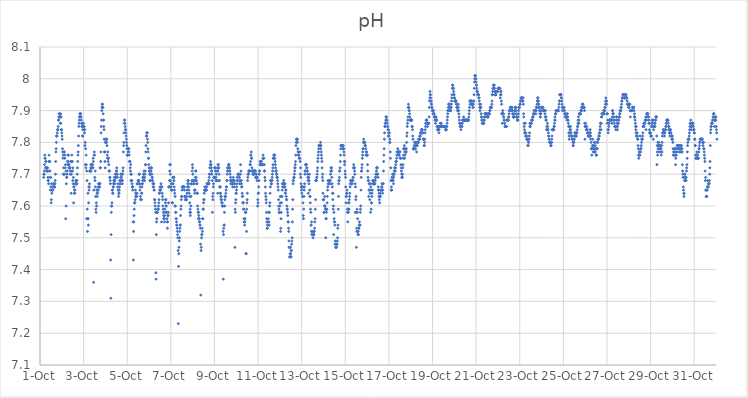
| Category | pH |
|---|---|
| 44470.166666666664 | 7.69 |
| 44470.177083333336 | 7.7 |
| 44470.1875 | 7.7 |
| 44470.197916666664 | 7.71 |
| 44470.208333333336 | 7.73 |
| 44470.21875 | 7.76 |
| 44470.229166666664 | 7.75 |
| 44470.239583333336 | 7.75 |
| 44470.25 | 7.72 |
| 44470.260416666664 | 7.74 |
| 44470.270833333336 | 7.74 |
| 44470.28125 | 7.72 |
| 44470.291666666664 | 7.72 |
| 44470.302083333336 | 7.71 |
| 44470.3125 | 7.72 |
| 44470.322916666664 | 7.72 |
| 44470.333333333336 | 7.71 |
| 44470.34375 | 7.72 |
| 44470.354166666664 | 7.71 |
| 44470.364583333336 | 7.69 |
| 44470.375 | 7.68 |
| 44470.385416666664 | 7.68 |
| 44470.395833333336 | 7.67 |
| 44470.40625 | 7.74 |
| 44470.416666666664 | 7.76 |
| 44470.427083333336 | 7.71 |
| 44470.4375 | 7.74 |
| 44470.447916666664 | 7.74 |
| 44470.458333333336 | 7.71 |
| 44470.46875 | 7.65 |
| 44470.479166666664 | 7.69 |
| 44470.489583333336 | 7.69 |
| 44470.5 | 7.66 |
| 44470.510416666664 | 7.61 |
| 44470.520833333336 | 7.62 |
| 44470.53125 | 7.67 |
| 44470.541666666664 | 7.64 |
| 44470.552083333336 | 7.65 |
| 44470.5625 | 7.65 |
| 44470.572916666664 | 7.65 |
| 44470.583333333336 | 7.65 |
| 44470.59375 | 7.66 |
| 44470.604166666664 | 7.66 |
| 44470.614583333336 | 7.67 |
| 44470.625 | 7.67 |
| 44470.635416666664 | 7.67 |
| 44470.645833333336 | 7.66 |
| 44470.65625 | 7.66 |
| 44470.666666666664 | 7.66 |
| 44470.677083333336 | 7.66 |
| 44470.6875 | 7.67 |
| 44470.697916666664 | 7.68 |
| 44470.708333333336 | 7.7 |
| 44470.71875 | 7.74 |
| 44470.729166666664 | 7.77 |
| 44470.739583333336 | 7.78 |
| 44470.75 | 7.8 |
| 44470.760416666664 | 7.82 |
| 44470.770833333336 | 7.82 |
| 44470.78125 | 7.82 |
| 44470.791666666664 | 7.83 |
| 44470.802083333336 | 7.84 |
| 44470.8125 | 7.84 |
| 44470.822916666664 | 7.84 |
| 44470.833333333336 | 7.85 |
| 44470.84375 | 7.87 |
| 44470.854166666664 | 7.87 |
| 44470.864583333336 | 7.88 |
| 44470.875 | 7.89 |
| 44470.885416666664 | 7.88 |
| 44470.895833333336 | 7.89 |
| 44470.90625 | 7.88 |
| 44470.916666666664 | 7.88 |
| 44470.927083333336 | 7.86 |
| 44470.9375 | 7.88 |
| 44470.947916666664 | 7.89 |
| 44470.958333333336 | 7.86 |
| 44470.96875 | 7.88 |
| 44470.979166666664 | 7.84 |
| 44470.989583333336 | 7.84 |
| 44471.0 | 7.83 |
| 44471.010416666664 | 7.82 |
| 44471.020833333336 | 7.81 |
| 44471.03125 | 7.78 |
| 44471.041666666664 | 7.77 |
| 44471.052083333336 | 7.75 |
| 44471.0625 | 7.76 |
| 44471.072916666664 | 7.7 |
| 44471.083333333336 | 7.72 |
| 44471.09375 | 7.7 |
| 44471.104166666664 | 7.77 |
| 44471.114583333336 | 7.77 |
| 44471.125 | 7.7 |
| 44471.135416666664 | 7.75 |
| 44471.145833333336 | 7.76 |
| 44471.15625 | 7.72 |
| 44471.166666666664 | 7.73 |
| 44471.177083333336 | 7.56 |
| 44471.1875 | 7.71 |
| 44471.197916666664 | 7.6 |
| 44471.208333333336 | 7.67 |
| 44471.21875 | 7.69 |
| 44471.229166666664 | 7.69 |
| 44471.239583333336 | 7.7 |
| 44471.25 | 7.71 |
| 44471.260416666664 | 7.74 |
| 44471.270833333336 | 7.73 |
| 44471.28125 | 7.76 |
| 44471.291666666664 | 7.74 |
| 44471.302083333336 | 7.76 |
| 44471.3125 | 7.73 |
| 44471.322916666664 | 7.72 |
| 44471.333333333336 | 7.73 |
| 44471.34375 | 7.72 |
| 44471.354166666664 | 7.72 |
| 44471.364583333336 | 7.72 |
| 44471.375 | 7.72 |
| 44471.385416666664 | 7.7 |
| 44471.395833333336 | 7.71 |
| 44471.40625 | 7.74 |
| 44471.416666666664 | 7.71 |
| 44471.427083333336 | 7.64 |
| 44471.4375 | 7.7 |
| 44471.447916666664 | 7.74 |
| 44471.458333333336 | 7.76 |
| 44471.46875 | 7.74 |
| 44471.479166666664 | 7.74 |
| 44471.489583333336 | 7.71 |
| 44471.5 | 7.68 |
| 44471.510416666664 | 7.72 |
| 44471.520833333336 | 7.67 |
| 44471.53125 | 7.69 |
| 44471.541666666664 | 7.61 |
| 44471.552083333336 | 7.66 |
| 44471.5625 | 7.66 |
| 44471.572916666664 | 7.64 |
| 44471.583333333336 | 7.65 |
| 44471.59375 | 7.64 |
| 44471.604166666664 | 7.65 |
| 44471.614583333336 | 7.67 |
| 44471.625 | 7.67 |
| 44471.635416666664 | 7.67 |
| 44471.645833333336 | 7.68 |
| 44471.65625 | 7.68 |
| 44471.666666666664 | 7.67 |
| 44471.677083333336 | 7.67 |
| 44471.6875 | 7.67 |
| 44471.697916666664 | 7.68 |
| 44471.708333333336 | 7.7 |
| 44471.71875 | 7.72 |
| 44471.729166666664 | 7.74 |
| 44471.739583333336 | 7.76 |
| 44471.75 | 7.77 |
| 44471.760416666664 | 7.79 |
| 44471.770833333336 | 7.82 |
| 44471.78125 | 7.85 |
| 44471.791666666664 | 7.86 |
| 44471.802083333336 | 7.87 |
| 44471.8125 | 7.88 |
| 44471.822916666664 | 7.88 |
| 44471.833333333336 | 7.89 |
| 44471.84375 | 7.89 |
| 44471.854166666664 | 7.89 |
| 44471.864583333336 | 7.89 |
| 44471.875 | 7.88 |
| 44471.885416666664 | 7.88 |
| 44471.895833333336 | 7.87 |
| 44471.90625 | 7.86 |
| 44471.916666666664 | 7.85 |
| 44471.927083333336 | 7.86 |
| 44471.9375 | 7.85 |
| 44471.947916666664 | 7.82 |
| 44471.958333333336 | 7.84 |
| 44471.96875 | 7.82 |
| 44471.979166666664 | 7.86 |
| 44471.989583333336 | 7.86 |
| 44472.0 | 7.85 |
| 44472.010416666664 | 7.85 |
| 44472.020833333336 | 7.85 |
| 44472.03125 | 7.84 |
| 44472.041666666664 | 7.83 |
| 44472.052083333336 | 7.84 |
| 44472.0625 | 7.79 |
| 44472.072916666664 | 7.8 |
| 44472.083333333336 | 7.73 |
| 44472.09375 | 7.78 |
| 44472.104166666664 | 7.72 |
| 44472.114583333336 | 7.76 |
| 44472.125 | 7.73 |
| 44472.135416666664 | 7.56 |
| 44472.145833333336 | 7.71 |
| 44472.15625 | 7.68 |
| 44472.166666666664 | 7.59 |
| 44472.177083333336 | 7.52 |
| 44472.1875 | 7.56 |
| 44472.197916666664 | 7.64 |
| 44472.208333333336 | 7.56 |
| 44472.21875 | 7.54 |
| 44472.229166666664 | 7.61 |
| 44472.239583333336 | 7.66 |
| 44472.25 | 7.65 |
| 44472.260416666664 | 7.66 |
| 44472.270833333336 | 7.67 |
| 44472.28125 | 7.71 |
| 44472.291666666664 | 7.71 |
| 44472.302083333336 | 7.71 |
| 44472.3125 | 7.71 |
| 44472.322916666664 | 7.72 |
| 44472.333333333336 | 7.73 |
| 44472.34375 | 7.71 |
| 44472.354166666664 | 7.72 |
| 44472.364583333336 | 7.73 |
| 44472.375 | 7.73 |
| 44472.385416666664 | 7.73 |
| 44472.395833333336 | 7.73 |
| 44472.40625 | 7.73 |
| 44472.416666666664 | 7.72 |
| 44472.427083333336 | 7.72 |
| 44472.4375 | 7.75 |
| 44472.447916666664 | 7.74 |
| 44472.458333333336 | 7.36 |
| 44472.46875 | 7.65 |
| 44472.479166666664 | 7.76 |
| 44472.489583333336 | 7.77 |
| 44472.5 | 7.76 |
| 44472.510416666664 | 7.69 |
| 44472.520833333336 | 7.68 |
| 44472.53125 | 7.71 |
| 44472.541666666664 | 7.66 |
| 44472.552083333336 | 7.63 |
| 44472.5625 | 7.59 |
| 44472.572916666664 | 7.58 |
| 44472.583333333336 | 7.61 |
| 44472.59375 | 7.6 |
| 44472.604166666664 | 7.65 |
| 44472.614583333336 | 7.64 |
| 44472.625 | 7.63 |
| 44472.635416666664 | 7.65 |
| 44472.645833333336 | 7.64 |
| 44472.65625 | 7.65 |
| 44472.666666666664 | 7.65 |
| 44472.677083333336 | 7.66 |
| 44472.6875 | 7.67 |
| 44472.697916666664 | 7.67 |
| 44472.708333333336 | 7.67 |
| 44472.71875 | 7.66 |
| 44472.729166666664 | 7.66 |
| 44472.739583333336 | 7.67 |
| 44472.75 | 7.67 |
| 44472.760416666664 | 7.72 |
| 44472.770833333336 | 7.72 |
| 44472.78125 | 7.74 |
| 44472.791666666664 | 7.77 |
| 44472.802083333336 | 7.83 |
| 44472.8125 | 7.85 |
| 44472.822916666664 | 7.87 |
| 44472.833333333336 | 7.9 |
| 44472.84375 | 7.91 |
| 44472.854166666664 | 7.92 |
| 44472.864583333336 | 7.92 |
| 44472.875 | 7.91 |
| 44472.885416666664 | 7.91 |
| 44472.895833333336 | 7.89 |
| 44472.90625 | 7.87 |
| 44472.916666666664 | 7.87 |
| 44472.927083333336 | 7.85 |
| 44472.9375 | 7.84 |
| 44472.947916666664 | 7.81 |
| 44472.958333333336 | 7.77 |
| 44472.96875 | 7.77 |
| 44472.979166666664 | 7.74 |
| 44472.989583333336 | 7.72 |
| 44473.0 | 7.8 |
| 44473.010416666664 | 7.8 |
| 44473.020833333336 | 7.81 |
| 44473.03125 | 7.8 |
| 44473.041666666664 | 7.81 |
| 44473.052083333336 | 7.8 |
| 44473.0625 | 7.81 |
| 44473.072916666664 | 7.79 |
| 44473.083333333336 | 7.76 |
| 44473.09375 | 7.75 |
| 44473.104166666664 | 7.77 |
| 44473.114583333336 | 7.75 |
| 44473.125 | 7.74 |
| 44473.135416666664 | 7.75 |
| 44473.145833333336 | 7.75 |
| 44473.15625 | 7.73 |
| 44473.166666666664 | 7.71 |
| 44473.177083333336 | 7.71 |
| 44473.1875 | 7.71 |
| 44473.197916666664 | 7.69 |
| 44473.208333333336 | 7.69 |
| 44473.21875 | 7.68 |
| 44473.229166666664 | 7.67 |
| 44473.239583333336 | 7.43 |
| 44473.25 | 7.31 |
| 44473.260416666664 | 7.51 |
| 44473.270833333336 | 7.58 |
| 44473.28125 | 7.6 |
| 44473.291666666664 | 7.6 |
| 44473.302083333336 | 7.61 |
| 44473.3125 | 7.65 |
| 44473.322916666664 | 7.65 |
| 44473.333333333336 | 7.64 |
| 44473.34375 | 7.64 |
| 44473.354166666664 | 7.66 |
| 44473.364583333336 | 7.66 |
| 44473.375 | 7.67 |
| 44473.385416666664 | 7.68 |
| 44473.395833333336 | 7.67 |
| 44473.40625 | 7.69 |
| 44473.416666666664 | 7.68 |
| 44473.427083333336 | 7.67 |
| 44473.4375 | 7.68 |
| 44473.447916666664 | 7.69 |
| 44473.458333333336 | 7.7 |
| 44473.46875 | 7.69 |
| 44473.479166666664 | 7.7 |
| 44473.489583333336 | 7.69 |
| 44473.5 | 7.71 |
| 44473.510416666664 | 7.71 |
| 44473.520833333336 | 7.72 |
| 44473.53125 | 7.7 |
| 44473.541666666664 | 7.7 |
| 44473.552083333336 | 7.69 |
| 44473.5625 | 7.66 |
| 44473.572916666664 | 7.67 |
| 44473.583333333336 | 7.65 |
| 44473.59375 | 7.65 |
| 44473.604166666664 | 7.63 |
| 44473.614583333336 | 7.64 |
| 44473.625 | 7.64 |
| 44473.635416666664 | 7.65 |
| 44473.645833333336 | 7.66 |
| 44473.65625 | 7.68 |
| 44473.666666666664 | 7.67 |
| 44473.677083333336 | 7.68 |
| 44473.6875 | 7.67 |
| 44473.697916666664 | 7.69 |
| 44473.708333333336 | 7.7 |
| 44473.71875 | 7.7 |
| 44473.729166666664 | 7.7 |
| 44473.739583333336 | 7.69 |
| 44473.75 | 7.68 |
| 44473.760416666664 | 7.68 |
| 44473.770833333336 | 7.67 |
| 44473.78125 | 7.68 |
| 44473.791666666664 | 7.7 |
| 44473.802083333336 | 7.71 |
| 44473.8125 | 7.72 |
| 44473.822916666664 | 7.77 |
| 44473.833333333336 | 7.79 |
| 44473.84375 | 7.8 |
| 44473.854166666664 | 7.83 |
| 44473.864583333336 | 7.86 |
| 44473.875 | 7.87 |
| 44473.885416666664 | 7.87 |
| 44473.895833333336 | 7.86 |
| 44473.90625 | 7.85 |
| 44473.916666666664 | 7.84 |
| 44473.927083333336 | 7.84 |
| 44473.9375 | 7.83 |
| 44473.947916666664 | 7.82 |
| 44473.958333333336 | 7.81 |
| 44473.96875 | 7.8 |
| 44473.979166666664 | 7.79 |
| 44473.989583333336 | 7.78 |
| 44474.0 | 7.76 |
| 44474.010416666664 | 7.76 |
| 44474.020833333336 | 7.76 |
| 44474.03125 | 7.77 |
| 44474.041666666664 | 7.78 |
| 44474.052083333336 | 7.78 |
| 44474.0625 | 7.78 |
| 44474.072916666664 | 7.78 |
| 44474.083333333336 | 7.77 |
| 44474.09375 | 7.76 |
| 44474.104166666664 | 7.74 |
| 44474.114583333336 | 7.74 |
| 44474.125 | 7.74 |
| 44474.135416666664 | 7.72 |
| 44474.145833333336 | 7.71 |
| 44474.15625 | 7.73 |
| 44474.166666666664 | 7.7 |
| 44474.177083333336 | 7.68 |
| 44474.1875 | 7.7 |
| 44474.197916666664 | 7.68 |
| 44474.208333333336 | 7.68 |
| 44474.21875 | 7.67 |
| 44474.229166666664 | 7.66 |
| 44474.239583333336 | 7.66 |
| 44474.25 | 7.65 |
| 44474.260416666664 | 7.66 |
| 44474.270833333336 | 7.55 |
| 44474.28125 | 7.43 |
| 44474.291666666664 | 7.52 |
| 44474.302083333336 | 7.55 |
| 44474.3125 | 7.57 |
| 44474.322916666664 | 7.59 |
| 44474.333333333336 | 7.61 |
| 44474.34375 | 7.61 |
| 44474.354166666664 | 7.61 |
| 44474.364583333336 | 7.62 |
| 44474.375 | 7.65 |
| 44474.385416666664 | 7.64 |
| 44474.395833333336 | 7.63 |
| 44474.40625 | 7.63 |
| 44474.416666666664 | 7.63 |
| 44474.427083333336 | 7.64 |
| 44474.4375 | 7.63 |
| 44474.447916666664 | 7.64 |
| 44474.458333333336 | 7.67 |
| 44474.46875 | 7.67 |
| 44474.479166666664 | 7.67 |
| 44474.489583333336 | 7.67 |
| 44474.5 | 7.68 |
| 44474.510416666664 | 7.68 |
| 44474.520833333336 | 7.68 |
| 44474.53125 | 7.68 |
| 44474.541666666664 | 7.7 |
| 44474.552083333336 | 7.67 |
| 44474.5625 | 7.7 |
| 44474.572916666664 | 7.67 |
| 44474.583333333336 | 7.65 |
| 44474.59375 | 7.66 |
| 44474.604166666664 | 7.63 |
| 44474.614583333336 | 7.62 |
| 44474.625 | 7.62 |
| 44474.635416666664 | 7.62 |
| 44474.645833333336 | 7.62 |
| 44474.65625 | 7.64 |
| 44474.666666666664 | 7.64 |
| 44474.677083333336 | 7.66 |
| 44474.6875 | 7.67 |
| 44474.697916666664 | 7.67 |
| 44474.708333333336 | 7.68 |
| 44474.71875 | 7.69 |
| 44474.729166666664 | 7.69 |
| 44474.739583333336 | 7.69 |
| 44474.75 | 7.7 |
| 44474.760416666664 | 7.7 |
| 44474.770833333336 | 7.71 |
| 44474.78125 | 7.68 |
| 44474.791666666664 | 7.68 |
| 44474.802083333336 | 7.69 |
| 44474.8125 | 7.7 |
| 44474.822916666664 | 7.71 |
| 44474.833333333336 | 7.73 |
| 44474.84375 | 7.73 |
| 44474.854166666664 | 7.77 |
| 44474.864583333336 | 7.79 |
| 44474.875 | 7.82 |
| 44474.885416666664 | 7.82 |
| 44474.895833333336 | 7.83 |
| 44474.90625 | 7.83 |
| 44474.916666666664 | 7.83 |
| 44474.927083333336 | 7.81 |
| 44474.9375 | 7.8 |
| 44474.947916666664 | 7.78 |
| 44474.958333333336 | 7.77 |
| 44474.96875 | 7.75 |
| 44474.979166666664 | 7.75 |
| 44474.989583333336 | 7.73 |
| 44475.0 | 7.72 |
| 44475.010416666664 | 7.71 |
| 44475.020833333336 | 7.71 |
| 44475.03125 | 7.7 |
| 44475.041666666664 | 7.68 |
| 44475.052083333336 | 7.68 |
| 44475.0625 | 7.7 |
| 44475.072916666664 | 7.71 |
| 44475.083333333336 | 7.72 |
| 44475.09375 | 7.71 |
| 44475.104166666664 | 7.72 |
| 44475.114583333336 | 7.72 |
| 44475.125 | 7.7 |
| 44475.135416666664 | 7.69 |
| 44475.145833333336 | 7.68 |
| 44475.15625 | 7.69 |
| 44475.166666666664 | 7.68 |
| 44475.177083333336 | 7.67 |
| 44475.1875 | 7.66 |
| 44475.197916666664 | 7.67 |
| 44475.208333333336 | 7.66 |
| 44475.21875 | 7.67 |
| 44475.229166666664 | 7.65 |
| 44475.239583333336 | 7.65 |
| 44475.25 | 7.62 |
| 44475.260416666664 | 7.62 |
| 44475.270833333336 | 7.61 |
| 44475.28125 | 7.6 |
| 44475.291666666664 | 7.59 |
| 44475.302083333336 | 7.58 |
| 44475.3125 | 7.39 |
| 44475.322916666664 | 7.37 |
| 44475.333333333336 | 7.51 |
| 44475.34375 | 7.55 |
| 44475.354166666664 | 7.56 |
| 44475.364583333336 | 7.58 |
| 44475.375 | 7.58 |
| 44475.385416666664 | 7.58 |
| 44475.395833333336 | 7.59 |
| 44475.40625 | 7.59 |
| 44475.416666666664 | 7.59 |
| 44475.427083333336 | 7.59 |
| 44475.4375 | 7.6 |
| 44475.447916666664 | 7.61 |
| 44475.458333333336 | 7.62 |
| 44475.46875 | 7.64 |
| 44475.479166666664 | 7.64 |
| 44475.489583333336 | 7.65 |
| 44475.5 | 7.66 |
| 44475.510416666664 | 7.65 |
| 44475.520833333336 | 7.65 |
| 44475.53125 | 7.65 |
| 44475.541666666664 | 7.66 |
| 44475.552083333336 | 7.67 |
| 44475.5625 | 7.66 |
| 44475.572916666664 | 7.55 |
| 44475.583333333336 | 7.66 |
| 44475.59375 | 7.66 |
| 44475.604166666664 | 7.64 |
| 44475.614583333336 | 7.63 |
| 44475.625 | 7.62 |
| 44475.635416666664 | 7.6 |
| 44475.645833333336 | 7.59 |
| 44475.65625 | 7.58 |
| 44475.666666666664 | 7.57 |
| 44475.677083333336 | 7.56 |
| 44475.6875 | 7.56 |
| 44475.697916666664 | 7.56 |
| 44475.708333333336 | 7.55 |
| 44475.71875 | 7.57 |
| 44475.729166666664 | 7.59 |
| 44475.739583333336 | 7.58 |
| 44475.75 | 7.61 |
| 44475.760416666664 | 7.62 |
| 44475.770833333336 | 7.62 |
| 44475.78125 | 7.6 |
| 44475.791666666664 | 7.6 |
| 44475.802083333336 | 7.58 |
| 44475.8125 | 7.58 |
| 44475.822916666664 | 7.56 |
| 44475.833333333336 | 7.55 |
| 44475.84375 | 7.53 |
| 44475.854166666664 | 7.55 |
| 44475.864583333336 | 7.57 |
| 44475.875 | 7.57 |
| 44475.885416666664 | 7.58 |
| 44475.895833333336 | 7.61 |
| 44475.90625 | 7.66 |
| 44475.916666666664 | 7.66 |
| 44475.927083333336 | 7.66 |
| 44475.9375 | 7.68 |
| 44475.947916666664 | 7.71 |
| 44475.958333333336 | 7.73 |
| 44475.96875 | 7.73 |
| 44475.979166666664 | 7.7 |
| 44475.989583333336 | 7.68 |
| 44476.0 | 7.66 |
| 44476.010416666664 | 7.66 |
| 44476.020833333336 | 7.67 |
| 44476.03125 | 7.65 |
| 44476.041666666664 | 7.65 |
| 44476.052083333336 | 7.65 |
| 44476.0625 | 7.61 |
| 44476.072916666664 | 7.61 |
| 44476.083333333336 | 7.67 |
| 44476.09375 | 7.69 |
| 44476.104166666664 | 7.67 |
| 44476.114583333336 | 7.69 |
| 44476.125 | 7.69 |
| 44476.135416666664 | 7.69 |
| 44476.145833333336 | 7.68 |
| 44476.15625 | 7.66 |
| 44476.166666666664 | 7.65 |
| 44476.177083333336 | 7.64 |
| 44476.1875 | 7.6 |
| 44476.197916666664 | 7.63 |
| 44476.208333333336 | 7.6 |
| 44476.21875 | 7.58 |
| 44476.229166666664 | 7.58 |
| 44476.239583333336 | 7.56 |
| 44476.25 | 7.56 |
| 44476.260416666664 | 7.55 |
| 44476.270833333336 | 7.54 |
| 44476.28125 | 7.54 |
| 44476.291666666664 | 7.53 |
| 44476.302083333336 | 7.52 |
| 44476.3125 | 7.51 |
| 44476.322916666664 | 7.5 |
| 44476.333333333336 | 7.46 |
| 44476.34375 | 7.23 |
| 44476.354166666664 | 7.41 |
| 44476.364583333336 | 7.45 |
| 44476.375 | 7.47 |
| 44476.385416666664 | 7.49 |
| 44476.395833333336 | 7.5 |
| 44476.40625 | 7.52 |
| 44476.416666666664 | 7.53 |
| 44476.427083333336 | 7.54 |
| 44476.4375 | 7.54 |
| 44476.447916666664 | 7.57 |
| 44476.458333333336 | 7.59 |
| 44476.46875 | 7.6 |
| 44476.479166666664 | 7.62 |
| 44476.489583333336 | 7.63 |
| 44476.5 | 7.63 |
| 44476.510416666664 | 7.65 |
| 44476.520833333336 | 7.66 |
| 44476.53125 | 7.66 |
| 44476.541666666664 | 7.66 |
| 44476.552083333336 | 7.66 |
| 44476.5625 | 7.66 |
| 44476.572916666664 | 7.66 |
| 44476.583333333336 | 7.66 |
| 44476.59375 | 7.66 |
| 44476.604166666664 | 7.66 |
| 44476.614583333336 | 7.66 |
| 44476.625 | 7.65 |
| 44476.635416666664 | 7.63 |
| 44476.645833333336 | 7.63 |
| 44476.65625 | 7.63 |
| 44476.666666666664 | 7.62 |
| 44476.677083333336 | 7.62 |
| 44476.6875 | 7.62 |
| 44476.697916666664 | 7.62 |
| 44476.708333333336 | 7.62 |
| 44476.71875 | 7.62 |
| 44476.729166666664 | 7.63 |
| 44476.739583333336 | 7.64 |
| 44476.75 | 7.65 |
| 44476.760416666664 | 7.66 |
| 44476.770833333336 | 7.67 |
| 44476.78125 | 7.68 |
| 44476.791666666664 | 7.68 |
| 44476.802083333336 | 7.68 |
| 44476.8125 | 7.67 |
| 44476.822916666664 | 7.66 |
| 44476.833333333336 | 7.65 |
| 44476.84375 | 7.64 |
| 44476.854166666664 | 7.63 |
| 44476.864583333336 | 7.61 |
| 44476.875 | 7.58 |
| 44476.885416666664 | 7.59 |
| 44476.895833333336 | 7.57 |
| 44476.90625 | 7.58 |
| 44476.916666666664 | 7.6 |
| 44476.927083333336 | 7.63 |
| 44476.9375 | 7.67 |
| 44476.947916666664 | 7.67 |
| 44476.958333333336 | 7.67 |
| 44476.96875 | 7.68 |
| 44476.979166666664 | 7.71 |
| 44476.989583333336 | 7.73 |
| 44477.0 | 7.72 |
| 44477.010416666664 | 7.7 |
| 44477.020833333336 | 7.68 |
| 44477.03125 | 7.68 |
| 44477.041666666664 | 7.67 |
| 44477.052083333336 | 7.68 |
| 44477.0625 | 7.68 |
| 44477.072916666664 | 7.67 |
| 44477.083333333336 | 7.65 |
| 44477.09375 | 7.64 |
| 44477.104166666664 | 7.65 |
| 44477.114583333336 | 7.65 |
| 44477.125 | 7.69 |
| 44477.135416666664 | 7.71 |
| 44477.145833333336 | 7.68 |
| 44477.15625 | 7.71 |
| 44477.166666666664 | 7.69 |
| 44477.177083333336 | 7.68 |
| 44477.1875 | 7.67 |
| 44477.197916666664 | 7.67 |
| 44477.208333333336 | 7.64 |
| 44477.21875 | 7.64 |
| 44477.229166666664 | 7.6 |
| 44477.239583333336 | 7.59 |
| 44477.25 | 7.58 |
| 44477.260416666664 | 7.56 |
| 44477.270833333336 | 7.58 |
| 44477.28125 | 7.57 |
| 44477.291666666664 | 7.56 |
| 44477.302083333336 | 7.56 |
| 44477.3125 | 7.55 |
| 44477.322916666664 | 7.55 |
| 44477.333333333336 | 7.54 |
| 44477.34375 | 7.54 |
| 44477.354166666664 | 7.53 |
| 44477.364583333336 | 7.48 |
| 44477.375 | 7.32 |
| 44477.385416666664 | 7.46 |
| 44477.395833333336 | 7.47 |
| 44477.40625 | 7.5 |
| 44477.416666666664 | 7.51 |
| 44477.427083333336 | 7.51 |
| 44477.4375 | 7.53 |
| 44477.447916666664 | 7.52 |
| 44477.458333333336 | 7.56 |
| 44477.46875 | 7.56 |
| 44477.479166666664 | 7.59 |
| 44477.489583333336 | 7.59 |
| 44477.5 | 7.61 |
| 44477.510416666664 | 7.62 |
| 44477.520833333336 | 7.62 |
| 44477.53125 | 7.64 |
| 44477.541666666664 | 7.65 |
| 44477.552083333336 | 7.65 |
| 44477.5625 | 7.66 |
| 44477.572916666664 | 7.66 |
| 44477.583333333336 | 7.65 |
| 44477.59375 | 7.65 |
| 44477.604166666664 | 7.65 |
| 44477.614583333336 | 7.65 |
| 44477.625 | 7.65 |
| 44477.635416666664 | 7.65 |
| 44477.645833333336 | 7.66 |
| 44477.65625 | 7.67 |
| 44477.666666666664 | 7.67 |
| 44477.677083333336 | 7.67 |
| 44477.6875 | 7.67 |
| 44477.697916666664 | 7.67 |
| 44477.708333333336 | 7.67 |
| 44477.71875 | 7.67 |
| 44477.729166666664 | 7.67 |
| 44477.739583333336 | 7.68 |
| 44477.75 | 7.67 |
| 44477.760416666664 | 7.69 |
| 44477.770833333336 | 7.7 |
| 44477.78125 | 7.7 |
| 44477.791666666664 | 7.72 |
| 44477.802083333336 | 7.72 |
| 44477.8125 | 7.73 |
| 44477.822916666664 | 7.74 |
| 44477.833333333336 | 7.73 |
| 44477.84375 | 7.73 |
| 44477.854166666664 | 7.72 |
| 44477.864583333336 | 7.71 |
| 44477.875 | 7.71 |
| 44477.885416666664 | 7.7 |
| 44477.895833333336 | 7.68 |
| 44477.90625 | 7.58 |
| 44477.916666666664 | 7.63 |
| 44477.927083333336 | 7.62 |
| 44477.9375 | 7.64 |
| 44477.947916666664 | 7.66 |
| 44477.958333333336 | 7.67 |
| 44477.96875 | 7.69 |
| 44477.979166666664 | 7.69 |
| 44477.989583333336 | 7.69 |
| 44478.0 | 7.69 |
| 44478.010416666664 | 7.72 |
| 44478.020833333336 | 7.72 |
| 44478.03125 | 7.72 |
| 44478.041666666664 | 7.71 |
| 44478.052083333336 | 7.69 |
| 44478.0625 | 7.69 |
| 44478.072916666664 | 7.68 |
| 44478.083333333336 | 7.7 |
| 44478.09375 | 7.68 |
| 44478.104166666664 | 7.68 |
| 44478.114583333336 | 7.68 |
| 44478.125 | 7.71 |
| 44478.135416666664 | 7.72 |
| 44478.145833333336 | 7.64 |
| 44478.15625 | 7.71 |
| 44478.166666666664 | 7.73 |
| 44478.177083333336 | 7.73 |
| 44478.1875 | 7.72 |
| 44478.197916666664 | 7.72 |
| 44478.208333333336 | 7.7 |
| 44478.21875 | 7.68 |
| 44478.229166666664 | 7.68 |
| 44478.239583333336 | 7.66 |
| 44478.25 | 7.66 |
| 44478.260416666664 | 7.64 |
| 44478.270833333336 | 7.66 |
| 44478.28125 | 7.64 |
| 44478.291666666664 | 7.63 |
| 44478.302083333336 | 7.62 |
| 44478.3125 | 7.63 |
| 44478.322916666664 | 7.62 |
| 44478.333333333336 | 7.61 |
| 44478.34375 | 7.61 |
| 44478.354166666664 | 7.61 |
| 44478.364583333336 | 7.6 |
| 44478.375 | 7.6 |
| 44478.385416666664 | 7.6 |
| 44478.395833333336 | 7.52 |
| 44478.40625 | 7.37 |
| 44478.416666666664 | 7.51 |
| 44478.427083333336 | 7.53 |
| 44478.4375 | 7.54 |
| 44478.447916666664 | 7.54 |
| 44478.458333333336 | 7.58 |
| 44478.46875 | 7.6 |
| 44478.479166666664 | 7.62 |
| 44478.489583333336 | 7.63 |
| 44478.5 | 7.63 |
| 44478.510416666664 | 7.63 |
| 44478.520833333336 | 7.64 |
| 44478.53125 | 7.65 |
| 44478.541666666664 | 7.66 |
| 44478.552083333336 | 7.66 |
| 44478.5625 | 7.68 |
| 44478.572916666664 | 7.68 |
| 44478.583333333336 | 7.7 |
| 44478.59375 | 7.72 |
| 44478.604166666664 | 7.71 |
| 44478.614583333336 | 7.71 |
| 44478.625 | 7.72 |
| 44478.635416666664 | 7.72 |
| 44478.645833333336 | 7.73 |
| 44478.65625 | 7.73 |
| 44478.666666666664 | 7.73 |
| 44478.677083333336 | 7.72 |
| 44478.6875 | 7.71 |
| 44478.697916666664 | 7.72 |
| 44478.708333333336 | 7.71 |
| 44478.71875 | 7.7 |
| 44478.729166666664 | 7.68 |
| 44478.739583333336 | 7.69 |
| 44478.75 | 7.67 |
| 44478.760416666664 | 7.68 |
| 44478.770833333336 | 7.68 |
| 44478.78125 | 7.68 |
| 44478.791666666664 | 7.67 |
| 44478.802083333336 | 7.68 |
| 44478.8125 | 7.68 |
| 44478.822916666664 | 7.67 |
| 44478.833333333336 | 7.66 |
| 44478.84375 | 7.67 |
| 44478.854166666664 | 7.68 |
| 44478.864583333336 | 7.69 |
| 44478.875 | 7.68 |
| 44478.885416666664 | 7.68 |
| 44478.895833333336 | 7.67 |
| 44478.90625 | 7.66 |
| 44478.916666666664 | 7.68 |
| 44478.927083333336 | 7.67 |
| 44478.9375 | 7.47 |
| 44478.947916666664 | 7.59 |
| 44478.958333333336 | 7.58 |
| 44478.96875 | 7.61 |
| 44478.979166666664 | 7.62 |
| 44478.989583333336 | 7.64 |
| 44479.0 | 7.64 |
| 44479.010416666664 | 7.65 |
| 44479.020833333336 | 7.66 |
| 44479.03125 | 7.67 |
| 44479.041666666664 | 7.69 |
| 44479.052083333336 | 7.68 |
| 44479.0625 | 7.68 |
| 44479.072916666664 | 7.7 |
| 44479.083333333336 | 7.7 |
| 44479.09375 | 7.7 |
| 44479.104166666664 | 7.7 |
| 44479.114583333336 | 7.7 |
| 44479.125 | 7.7 |
| 44479.135416666664 | 7.69 |
| 44479.145833333336 | 7.69 |
| 44479.15625 | 7.67 |
| 44479.166666666664 | 7.68 |
| 44479.177083333336 | 7.67 |
| 44479.1875 | 7.7 |
| 44479.197916666664 | 7.73 |
| 44479.208333333336 | 7.68 |
| 44479.21875 | 7.71 |
| 44479.229166666664 | 7.68 |
| 44479.239583333336 | 7.67 |
| 44479.25 | 7.66 |
| 44479.260416666664 | 7.66 |
| 44479.270833333336 | 7.64 |
| 44479.28125 | 7.63 |
| 44479.291666666664 | 7.63 |
| 44479.302083333336 | 7.61 |
| 44479.3125 | 7.61 |
| 44479.322916666664 | 7.61 |
| 44479.333333333336 | 7.59 |
| 44479.34375 | 7.59 |
| 44479.354166666664 | 7.56 |
| 44479.364583333336 | 7.55 |
| 44479.375 | 7.55 |
| 44479.385416666664 | 7.54 |
| 44479.395833333336 | 7.55 |
| 44479.40625 | 7.56 |
| 44479.416666666664 | 7.58 |
| 44479.427083333336 | 7.58 |
| 44479.4375 | 7.58 |
| 44479.447916666664 | 7.45 |
| 44479.458333333336 | 7.45 |
| 44479.46875 | 7.52 |
| 44479.479166666664 | 7.59 |
| 44479.489583333336 | 7.61 |
| 44479.5 | 7.62 |
| 44479.510416666664 | 7.64 |
| 44479.520833333336 | 7.68 |
| 44479.53125 | 7.69 |
| 44479.541666666664 | 7.7 |
| 44479.552083333336 | 7.7 |
| 44479.5625 | 7.7 |
| 44479.572916666664 | 7.71 |
| 44479.583333333336 | 7.71 |
| 44479.59375 | 7.71 |
| 44479.604166666664 | 7.71 |
| 44479.614583333336 | 7.71 |
| 44479.625 | 7.71 |
| 44479.635416666664 | 7.73 |
| 44479.645833333336 | 7.73 |
| 44479.65625 | 7.74 |
| 44479.666666666664 | 7.76 |
| 44479.677083333336 | 7.76 |
| 44479.6875 | 7.77 |
| 44479.697916666664 | 7.75 |
| 44479.708333333336 | 7.75 |
| 44479.71875 | 7.72 |
| 44479.729166666664 | 7.71 |
| 44479.739583333336 | 7.71 |
| 44479.75 | 7.71 |
| 44479.760416666664 | 7.7 |
| 44479.770833333336 | 7.7 |
| 44479.78125 | 7.71 |
| 44479.791666666664 | 7.7 |
| 44479.802083333336 | 7.71 |
| 44479.8125 | 7.7 |
| 44479.822916666664 | 7.71 |
| 44479.833333333336 | 7.71 |
| 44479.84375 | 7.71 |
| 44479.854166666664 | 7.71 |
| 44479.864583333336 | 7.71 |
| 44479.875 | 7.71 |
| 44479.885416666664 | 7.69 |
| 44479.895833333336 | 7.69 |
| 44479.90625 | 7.7 |
| 44479.916666666664 | 7.7 |
| 44479.927083333336 | 7.69 |
| 44479.9375 | 7.69 |
| 44479.947916666664 | 7.68 |
| 44479.958333333336 | 7.69 |
| 44479.96875 | 7.69 |
| 44479.979166666664 | 7.6 |
| 44479.989583333336 | 7.62 |
| 44480.0 | 7.61 |
| 44480.010416666664 | 7.64 |
| 44480.020833333336 | 7.64 |
| 44480.03125 | 7.66 |
| 44480.041666666664 | 7.68 |
| 44480.052083333336 | 7.7 |
| 44480.0625 | 7.71 |
| 44480.072916666664 | 7.71 |
| 44480.083333333336 | 7.73 |
| 44480.09375 | 7.74 |
| 44480.104166666664 | 7.73 |
| 44480.114583333336 | 7.73 |
| 44480.125 | 7.73 |
| 44480.135416666664 | 7.74 |
| 44480.145833333336 | 7.74 |
| 44480.15625 | 7.74 |
| 44480.166666666664 | 7.73 |
| 44480.177083333336 | 7.73 |
| 44480.1875 | 7.73 |
| 44480.197916666664 | 7.73 |
| 44480.208333333336 | 7.73 |
| 44480.21875 | 7.75 |
| 44480.229166666664 | 7.76 |
| 44480.239583333336 | 7.75 |
| 44480.25 | 7.75 |
| 44480.260416666664 | 7.75 |
| 44480.270833333336 | 7.73 |
| 44480.28125 | 7.73 |
| 44480.291666666664 | 7.71 |
| 44480.302083333336 | 7.71 |
| 44480.3125 | 7.69 |
| 44480.322916666664 | 7.68 |
| 44480.333333333336 | 7.66 |
| 44480.34375 | 7.64 |
| 44480.354166666664 | 7.63 |
| 44480.364583333336 | 7.62 |
| 44480.375 | 7.61 |
| 44480.385416666664 | 7.58 |
| 44480.395833333336 | 7.56 |
| 44480.40625 | 7.55 |
| 44480.416666666664 | 7.53 |
| 44480.427083333336 | 7.53 |
| 44480.4375 | 7.54 |
| 44480.447916666664 | 7.54 |
| 44480.458333333336 | 7.55 |
| 44480.46875 | 7.56 |
| 44480.479166666664 | 7.58 |
| 44480.489583333336 | 7.58 |
| 44480.5 | 7.55 |
| 44480.510416666664 | 7.54 |
| 44480.520833333336 | 7.58 |
| 44480.53125 | 7.6 |
| 44480.541666666664 | 7.61 |
| 44480.552083333336 | 7.64 |
| 44480.5625 | 7.66 |
| 44480.572916666664 | 7.68 |
| 44480.583333333336 | 7.68 |
| 44480.59375 | 7.68 |
| 44480.604166666664 | 7.67 |
| 44480.614583333336 | 7.67 |
| 44480.625 | 7.68 |
| 44480.635416666664 | 7.68 |
| 44480.645833333336 | 7.69 |
| 44480.65625 | 7.7 |
| 44480.666666666664 | 7.71 |
| 44480.677083333336 | 7.72 |
| 44480.6875 | 7.73 |
| 44480.697916666664 | 7.75 |
| 44480.708333333336 | 7.75 |
| 44480.71875 | 7.76 |
| 44480.729166666664 | 7.75 |
| 44480.739583333336 | 7.76 |
| 44480.75 | 7.76 |
| 44480.760416666664 | 7.76 |
| 44480.770833333336 | 7.75 |
| 44480.78125 | 7.74 |
| 44480.791666666664 | 7.73 |
| 44480.802083333336 | 7.72 |
| 44480.8125 | 7.71 |
| 44480.822916666664 | 7.71 |
| 44480.833333333336 | 7.71 |
| 44480.84375 | 7.7 |
| 44480.854166666664 | 7.7 |
| 44480.864583333336 | 7.69 |
| 44480.875 | 7.69 |
| 44480.885416666664 | 7.69 |
| 44480.895833333336 | 7.68 |
| 44480.90625 | 7.67 |
| 44480.916666666664 | 7.66 |
| 44480.927083333336 | 7.65 |
| 44480.9375 | 7.62 |
| 44480.947916666664 | 7.6 |
| 44480.958333333336 | 7.59 |
| 44480.96875 | 7.58 |
| 44480.979166666664 | 7.58 |
| 44480.989583333336 | 7.58 |
| 44481.0 | 7.6 |
| 44481.010416666664 | 7.61 |
| 44481.020833333336 | 7.63 |
| 44481.03125 | 7.52 |
| 44481.041666666664 | 7.53 |
| 44481.052083333336 | 7.56 |
| 44481.0625 | 7.58 |
| 44481.072916666664 | 7.61 |
| 44481.083333333336 | 7.63 |
| 44481.09375 | 7.63 |
| 44481.104166666664 | 7.65 |
| 44481.114583333336 | 7.67 |
| 44481.125 | 7.66 |
| 44481.135416666664 | 7.67 |
| 44481.145833333336 | 7.67 |
| 44481.15625 | 7.67 |
| 44481.166666666664 | 7.67 |
| 44481.177083333336 | 7.68 |
| 44481.1875 | 7.66 |
| 44481.197916666664 | 7.67 |
| 44481.208333333336 | 7.66 |
| 44481.21875 | 7.66 |
| 44481.229166666664 | 7.66 |
| 44481.239583333336 | 7.67 |
| 44481.25 | 7.64 |
| 44481.260416666664 | 7.64 |
| 44481.270833333336 | 7.65 |
| 44481.28125 | 7.65 |
| 44481.291666666664 | 7.63 |
| 44481.302083333336 | 7.62 |
| 44481.3125 | 7.62 |
| 44481.322916666664 | 7.6 |
| 44481.333333333336 | 7.59 |
| 44481.34375 | 7.59 |
| 44481.354166666664 | 7.58 |
| 44481.364583333336 | 7.57 |
| 44481.375 | 7.55 |
| 44481.385416666664 | 7.55 |
| 44481.395833333336 | 7.53 |
| 44481.40625 | 7.52 |
| 44481.416666666664 | 7.49 |
| 44481.427083333336 | 7.47 |
| 44481.4375 | 7.47 |
| 44481.447916666664 | 7.44 |
| 44481.458333333336 | 7.44 |
| 44481.46875 | 7.45 |
| 44481.479166666664 | 7.44 |
| 44481.489583333336 | 7.47 |
| 44481.5 | 7.45 |
| 44481.510416666664 | 7.46 |
| 44481.520833333336 | 7.44 |
| 44481.53125 | 7.46 |
| 44481.541666666664 | 7.48 |
| 44481.552083333336 | 7.49 |
| 44481.5625 | 7.5 |
| 44481.572916666664 | 7.55 |
| 44481.583333333336 | 7.59 |
| 44481.59375 | 7.62 |
| 44481.604166666664 | 7.67 |
| 44481.614583333336 | 7.68 |
| 44481.625 | 7.68 |
| 44481.635416666664 | 7.69 |
| 44481.645833333336 | 7.69 |
| 44481.65625 | 7.69 |
| 44481.666666666664 | 7.7 |
| 44481.677083333336 | 7.71 |
| 44481.6875 | 7.72 |
| 44481.697916666664 | 7.72 |
| 44481.708333333336 | 7.73 |
| 44481.71875 | 7.74 |
| 44481.729166666664 | 7.76 |
| 44481.739583333336 | 7.79 |
| 44481.75 | 7.8 |
| 44481.760416666664 | 7.81 |
| 44481.770833333336 | 7.81 |
| 44481.78125 | 7.81 |
| 44481.791666666664 | 7.81 |
| 44481.802083333336 | 7.81 |
| 44481.8125 | 7.8 |
| 44481.822916666664 | 7.78 |
| 44481.833333333336 | 7.77 |
| 44481.84375 | 7.76 |
| 44481.854166666664 | 7.76 |
| 44481.864583333336 | 7.77 |
| 44481.875 | 7.76 |
| 44481.885416666664 | 7.75 |
| 44481.895833333336 | 7.75 |
| 44481.90625 | 7.77 |
| 44481.916666666664 | 7.75 |
| 44481.927083333336 | 7.74 |
| 44481.9375 | 7.7 |
| 44481.947916666664 | 7.72 |
| 44481.958333333336 | 7.69 |
| 44481.96875 | 7.67 |
| 44481.979166666664 | 7.66 |
| 44481.989583333336 | 7.65 |
| 44482.0 | 7.66 |
| 44482.010416666664 | 7.64 |
| 44482.020833333336 | 7.66 |
| 44482.03125 | 7.63 |
| 44482.041666666664 | 7.66 |
| 44482.052083333336 | 7.66 |
| 44482.0625 | 7.61 |
| 44482.072916666664 | 7.57 |
| 44482.083333333336 | 7.56 |
| 44482.09375 | 7.59 |
| 44482.104166666664 | 7.63 |
| 44482.114583333336 | 7.65 |
| 44482.125 | 7.66 |
| 44482.135416666664 | 7.67 |
| 44482.145833333336 | 7.7 |
| 44482.15625 | 7.71 |
| 44482.166666666664 | 7.71 |
| 44482.177083333336 | 7.73 |
| 44482.1875 | 7.73 |
| 44482.197916666664 | 7.73 |
| 44482.208333333336 | 7.73 |
| 44482.21875 | 7.73 |
| 44482.229166666664 | 7.72 |
| 44482.239583333336 | 7.72 |
| 44482.25 | 7.71 |
| 44482.260416666664 | 7.71 |
| 44482.270833333336 | 7.7 |
| 44482.28125 | 7.69 |
| 44482.291666666664 | 7.68 |
| 44482.302083333336 | 7.64 |
| 44482.3125 | 7.69 |
| 44482.322916666664 | 7.69 |
| 44482.333333333336 | 7.67 |
| 44482.34375 | 7.68 |
| 44482.354166666664 | 7.7 |
| 44482.364583333336 | 7.65 |
| 44482.375 | 7.63 |
| 44482.385416666664 | 7.63 |
| 44482.395833333336 | 7.61 |
| 44482.40625 | 7.59 |
| 44482.416666666664 | 7.58 |
| 44482.427083333336 | 7.54 |
| 44482.4375 | 7.54 |
| 44482.447916666664 | 7.52 |
| 44482.458333333336 | 7.55 |
| 44482.46875 | 7.51 |
| 44482.479166666664 | 7.52 |
| 44482.489583333336 | 7.51 |
| 44482.5 | 7.51 |
| 44482.510416666664 | 7.51 |
| 44482.520833333336 | 7.5 |
| 44482.53125 | 7.51 |
| 44482.541666666664 | 7.51 |
| 44482.552083333336 | 7.52 |
| 44482.5625 | 7.51 |
| 44482.572916666664 | 7.52 |
| 44482.583333333336 | 7.52 |
| 44482.59375 | 7.53 |
| 44482.604166666664 | 7.55 |
| 44482.614583333336 | 7.56 |
| 44482.625 | 7.59 |
| 44482.635416666664 | 7.62 |
| 44482.645833333336 | 7.68 |
| 44482.65625 | 7.68 |
| 44482.666666666664 | 7.68 |
| 44482.677083333336 | 7.68 |
| 44482.6875 | 7.69 |
| 44482.697916666664 | 7.69 |
| 44482.708333333336 | 7.7 |
| 44482.71875 | 7.71 |
| 44482.729166666664 | 7.72 |
| 44482.739583333336 | 7.74 |
| 44482.75 | 7.75 |
| 44482.760416666664 | 7.76 |
| 44482.770833333336 | 7.77 |
| 44482.78125 | 7.78 |
| 44482.791666666664 | 7.79 |
| 44482.802083333336 | 7.79 |
| 44482.8125 | 7.79 |
| 44482.822916666664 | 7.79 |
| 44482.833333333336 | 7.79 |
| 44482.84375 | 7.79 |
| 44482.854166666664 | 7.79 |
| 44482.864583333336 | 7.8 |
| 44482.875 | 7.78 |
| 44482.885416666664 | 7.79 |
| 44482.895833333336 | 7.77 |
| 44482.90625 | 7.76 |
| 44482.916666666664 | 7.75 |
| 44482.927083333336 | 7.74 |
| 44482.9375 | 7.72 |
| 44482.947916666664 | 7.69 |
| 44482.958333333336 | 7.7 |
| 44482.96875 | 7.68 |
| 44482.979166666664 | 7.64 |
| 44482.989583333336 | 7.62 |
| 44483.0 | 7.62 |
| 44483.010416666664 | 7.62 |
| 44483.020833333336 | 7.58 |
| 44483.03125 | 7.58 |
| 44483.041666666664 | 7.6 |
| 44483.052083333336 | 7.63 |
| 44483.0625 | 7.6 |
| 44483.072916666664 | 7.6 |
| 44483.083333333336 | 7.59 |
| 44483.09375 | 7.59 |
| 44483.104166666664 | 7.5 |
| 44483.114583333336 | 7.56 |
| 44483.125 | 7.56 |
| 44483.135416666664 | 7.58 |
| 44483.145833333336 | 7.59 |
| 44483.15625 | 7.59 |
| 44483.166666666664 | 7.61 |
| 44483.177083333336 | 7.63 |
| 44483.1875 | 7.65 |
| 44483.197916666664 | 7.66 |
| 44483.208333333336 | 7.68 |
| 44483.21875 | 7.67 |
| 44483.229166666664 | 7.67 |
| 44483.239583333336 | 7.67 |
| 44483.25 | 7.68 |
| 44483.260416666664 | 7.68 |
| 44483.270833333336 | 7.67 |
| 44483.28125 | 7.68 |
| 44483.291666666664 | 7.68 |
| 44483.302083333336 | 7.67 |
| 44483.3125 | 7.68 |
| 44483.322916666664 | 7.7 |
| 44483.333333333336 | 7.71 |
| 44483.34375 | 7.72 |
| 44483.354166666664 | 7.72 |
| 44483.364583333336 | 7.72 |
| 44483.375 | 7.71 |
| 44483.385416666664 | 7.69 |
| 44483.395833333336 | 7.67 |
| 44483.40625 | 7.66 |
| 44483.416666666664 | 7.64 |
| 44483.427083333336 | 7.62 |
| 44483.4375 | 7.64 |
| 44483.447916666664 | 7.59 |
| 44483.458333333336 | 7.6 |
| 44483.46875 | 7.51 |
| 44483.479166666664 | 7.58 |
| 44483.489583333336 | 7.56 |
| 44483.5 | 7.55 |
| 44483.510416666664 | 7.55 |
| 44483.520833333336 | 7.54 |
| 44483.53125 | 7.48 |
| 44483.541666666664 | 7.49 |
| 44483.552083333336 | 7.48 |
| 44483.5625 | 7.47 |
| 44483.572916666664 | 7.47 |
| 44483.583333333336 | 7.47 |
| 44483.59375 | 7.47 |
| 44483.604166666664 | 7.48 |
| 44483.614583333336 | 7.48 |
| 44483.625 | 7.48 |
| 44483.635416666664 | 7.49 |
| 44483.645833333336 | 7.5 |
| 44483.65625 | 7.53 |
| 44483.666666666664 | 7.54 |
| 44483.677083333336 | 7.59 |
| 44483.6875 | 7.63 |
| 44483.697916666664 | 7.67 |
| 44483.708333333336 | 7.68 |
| 44483.71875 | 7.68 |
| 44483.729166666664 | 7.69 |
| 44483.739583333336 | 7.71 |
| 44483.75 | 7.71 |
| 44483.760416666664 | 7.72 |
| 44483.770833333336 | 7.74 |
| 44483.78125 | 7.76 |
| 44483.791666666664 | 7.78 |
| 44483.802083333336 | 7.79 |
| 44483.8125 | 7.79 |
| 44483.822916666664 | 7.79 |
| 44483.833333333336 | 7.79 |
| 44483.84375 | 7.79 |
| 44483.854166666664 | 7.79 |
| 44483.864583333336 | 7.79 |
| 44483.875 | 7.79 |
| 44483.885416666664 | 7.78 |
| 44483.895833333336 | 7.78 |
| 44483.90625 | 7.79 |
| 44483.916666666664 | 7.78 |
| 44483.927083333336 | 7.78 |
| 44483.9375 | 7.77 |
| 44483.947916666664 | 7.76 |
| 44483.958333333336 | 7.74 |
| 44483.96875 | 7.73 |
| 44483.979166666664 | 7.74 |
| 44483.989583333336 | 7.71 |
| 44484.0 | 7.7 |
| 44484.010416666664 | 7.69 |
| 44484.020833333336 | 7.66 |
| 44484.03125 | 7.61 |
| 44484.041666666664 | 7.63 |
| 44484.052083333336 | 7.63 |
| 44484.0625 | 7.64 |
| 44484.072916666664 | 7.64 |
| 44484.083333333336 | 7.65 |
| 44484.09375 | 7.58 |
| 44484.104166666664 | 7.59 |
| 44484.114583333336 | 7.55 |
| 44484.125 | 7.59 |
| 44484.135416666664 | 7.61 |
| 44484.145833333336 | 7.58 |
| 44484.15625 | 7.59 |
| 44484.166666666664 | 7.59 |
| 44484.177083333336 | 7.61 |
| 44484.1875 | 7.62 |
| 44484.197916666664 | 7.63 |
| 44484.208333333336 | 7.64 |
| 44484.21875 | 7.66 |
| 44484.229166666664 | 7.67 |
| 44484.239583333336 | 7.68 |
| 44484.25 | 7.68 |
| 44484.260416666664 | 7.68 |
| 44484.270833333336 | 7.68 |
| 44484.28125 | 7.67 |
| 44484.291666666664 | 7.67 |
| 44484.302083333336 | 7.68 |
| 44484.3125 | 7.67 |
| 44484.322916666664 | 7.68 |
| 44484.333333333336 | 7.68 |
| 44484.34375 | 7.68 |
| 44484.354166666664 | 7.69 |
| 44484.364583333336 | 7.69 |
| 44484.375 | 7.72 |
| 44484.385416666664 | 7.73 |
| 44484.395833333336 | 7.72 |
| 44484.40625 | 7.72 |
| 44484.416666666664 | 7.72 |
| 44484.427083333336 | 7.71 |
| 44484.4375 | 7.7 |
| 44484.447916666664 | 7.67 |
| 44484.458333333336 | 7.58 |
| 44484.46875 | 7.66 |
| 44484.479166666664 | 7.62 |
| 44484.489583333336 | 7.63 |
| 44484.5 | 7.58 |
| 44484.510416666664 | 7.47 |
| 44484.520833333336 | 7.53 |
| 44484.53125 | 7.52 |
| 44484.541666666664 | 7.59 |
| 44484.552083333336 | 7.58 |
| 44484.5625 | 7.56 |
| 44484.572916666664 | 7.52 |
| 44484.583333333336 | 7.51 |
| 44484.59375 | 7.52 |
| 44484.604166666664 | 7.51 |
| 44484.614583333336 | 7.53 |
| 44484.625 | 7.53 |
| 44484.635416666664 | 7.54 |
| 44484.645833333336 | 7.55 |
| 44484.65625 | 7.54 |
| 44484.666666666664 | 7.54 |
| 44484.677083333336 | 7.54 |
| 44484.6875 | 7.58 |
| 44484.697916666664 | 7.59 |
| 44484.708333333336 | 7.6 |
| 44484.71875 | 7.65 |
| 44484.729166666664 | 7.69 |
| 44484.739583333336 | 7.71 |
| 44484.75 | 7.71 |
| 44484.760416666664 | 7.72 |
| 44484.770833333336 | 7.73 |
| 44484.78125 | 7.75 |
| 44484.791666666664 | 7.76 |
| 44484.802083333336 | 7.77 |
| 44484.8125 | 7.78 |
| 44484.822916666664 | 7.78 |
| 44484.833333333336 | 7.8 |
| 44484.84375 | 7.81 |
| 44484.854166666664 | 7.8 |
| 44484.864583333336 | 7.8 |
| 44484.875 | 7.8 |
| 44484.885416666664 | 7.8 |
| 44484.895833333336 | 7.8 |
| 44484.90625 | 7.79 |
| 44484.916666666664 | 7.79 |
| 44484.927083333336 | 7.79 |
| 44484.9375 | 7.78 |
| 44484.947916666664 | 7.76 |
| 44484.958333333336 | 7.77 |
| 44484.96875 | 7.76 |
| 44484.979166666664 | 7.77 |
| 44484.989583333336 | 7.76 |
| 44485.0 | 7.76 |
| 44485.010416666664 | 7.76 |
| 44485.020833333336 | 7.73 |
| 44485.03125 | 7.71 |
| 44485.041666666664 | 7.69 |
| 44485.052083333336 | 7.68 |
| 44485.0625 | 7.68 |
| 44485.072916666664 | 7.63 |
| 44485.083333333336 | 7.65 |
| 44485.09375 | 7.67 |
| 44485.104166666664 | 7.65 |
| 44485.114583333336 | 7.67 |
| 44485.125 | 7.62 |
| 44485.135416666664 | 7.64 |
| 44485.145833333336 | 7.67 |
| 44485.15625 | 7.58 |
| 44485.166666666664 | 7.66 |
| 44485.177083333336 | 7.65 |
| 44485.1875 | 7.59 |
| 44485.197916666664 | 7.61 |
| 44485.208333333336 | 7.61 |
| 44485.21875 | 7.63 |
| 44485.229166666664 | 7.64 |
| 44485.239583333336 | 7.65 |
| 44485.25 | 7.67 |
| 44485.260416666664 | 7.68 |
| 44485.270833333336 | 7.68 |
| 44485.28125 | 7.68 |
| 44485.291666666664 | 7.67 |
| 44485.302083333336 | 7.67 |
| 44485.3125 | 7.67 |
| 44485.322916666664 | 7.67 |
| 44485.333333333336 | 7.67 |
| 44485.34375 | 7.67 |
| 44485.354166666664 | 7.67 |
| 44485.364583333336 | 7.68 |
| 44485.375 | 7.68 |
| 44485.385416666664 | 7.69 |
| 44485.395833333336 | 7.69 |
| 44485.40625 | 7.7 |
| 44485.416666666664 | 7.7 |
| 44485.427083333336 | 7.71 |
| 44485.4375 | 7.72 |
| 44485.447916666664 | 7.72 |
| 44485.458333333336 | 7.72 |
| 44485.46875 | 7.72 |
| 44485.479166666664 | 7.7 |
| 44485.489583333336 | 7.7 |
| 44485.5 | 7.69 |
| 44485.510416666664 | 7.66 |
| 44485.520833333336 | 7.65 |
| 44485.53125 | 7.65 |
| 44485.541666666664 | 7.63 |
| 44485.552083333336 | 7.64 |
| 44485.5625 | 7.62 |
| 44485.572916666664 | 7.61 |
| 44485.583333333336 | 7.63 |
| 44485.59375 | 7.64 |
| 44485.604166666664 | 7.63 |
| 44485.614583333336 | 7.63 |
| 44485.625 | 7.65 |
| 44485.635416666664 | 7.65 |
| 44485.645833333336 | 7.65 |
| 44485.65625 | 7.65 |
| 44485.666666666664 | 7.66 |
| 44485.677083333336 | 7.67 |
| 44485.6875 | 7.66 |
| 44485.697916666664 | 7.65 |
| 44485.708333333336 | 7.64 |
| 44485.71875 | 7.65 |
| 44485.729166666664 | 7.67 |
| 44485.739583333336 | 7.67 |
| 44485.75 | 7.71 |
| 44485.760416666664 | 7.74 |
| 44485.770833333336 | 7.76 |
| 44485.78125 | 7.78 |
| 44485.791666666664 | 7.81 |
| 44485.802083333336 | 7.83 |
| 44485.8125 | 7.85 |
| 44485.822916666664 | 7.85 |
| 44485.833333333336 | 7.86 |
| 44485.84375 | 7.86 |
| 44485.854166666664 | 7.87 |
| 44485.864583333336 | 7.88 |
| 44485.875 | 7.88 |
| 44485.885416666664 | 7.88 |
| 44485.895833333336 | 7.87 |
| 44485.90625 | 7.87 |
| 44485.916666666664 | 7.87 |
| 44485.927083333336 | 7.86 |
| 44485.9375 | 7.85 |
| 44485.947916666664 | 7.85 |
| 44485.958333333336 | 7.84 |
| 44485.96875 | 7.82 |
| 44485.979166666664 | 7.84 |
| 44485.989583333336 | 7.83 |
| 44486.0 | 7.83 |
| 44486.010416666664 | 7.82 |
| 44486.020833333336 | 7.83 |
| 44486.03125 | 7.8 |
| 44486.041666666664 | 7.81 |
| 44486.052083333336 | 7.8 |
| 44486.0625 | 7.77 |
| 44486.072916666664 | 7.75 |
| 44486.083333333336 | 7.72 |
| 44486.09375 | 7.68 |
| 44486.104166666664 | 7.65 |
| 44486.114583333336 | 7.66 |
| 44486.125 | 7.65 |
| 44486.135416666664 | 7.68 |
| 44486.145833333336 | 7.69 |
| 44486.15625 | 7.69 |
| 44486.166666666664 | 7.68 |
| 44486.177083333336 | 7.7 |
| 44486.1875 | 7.7 |
| 44486.197916666664 | 7.68 |
| 44486.208333333336 | 7.67 |
| 44486.21875 | 7.69 |
| 44486.229166666664 | 7.7 |
| 44486.239583333336 | 7.7 |
| 44486.25 | 7.71 |
| 44486.260416666664 | 7.71 |
| 44486.270833333336 | 7.72 |
| 44486.28125 | 7.72 |
| 44486.291666666664 | 7.71 |
| 44486.302083333336 | 7.72 |
| 44486.3125 | 7.73 |
| 44486.322916666664 | 7.74 |
| 44486.333333333336 | 7.74 |
| 44486.34375 | 7.74 |
| 44486.354166666664 | 7.75 |
| 44486.364583333336 | 7.76 |
| 44486.375 | 7.77 |
| 44486.385416666664 | 7.77 |
| 44486.395833333336 | 7.77 |
| 44486.40625 | 7.78 |
| 44486.416666666664 | 7.77 |
| 44486.427083333336 | 7.77 |
| 44486.4375 | 7.76 |
| 44486.447916666664 | 7.76 |
| 44486.458333333336 | 7.76 |
| 44486.46875 | 7.76 |
| 44486.479166666664 | 7.77 |
| 44486.489583333336 | 7.77 |
| 44486.5 | 7.77 |
| 44486.510416666664 | 7.77 |
| 44486.520833333336 | 7.75 |
| 44486.53125 | 7.75 |
| 44486.541666666664 | 7.75 |
| 44486.552083333336 | 7.73 |
| 44486.5625 | 7.72 |
| 44486.572916666664 | 7.71 |
| 44486.583333333336 | 7.7 |
| 44486.59375 | 7.69 |
| 44486.604166666664 | 7.69 |
| 44486.614583333336 | 7.69 |
| 44486.625 | 7.7 |
| 44486.635416666664 | 7.72 |
| 44486.645833333336 | 7.73 |
| 44486.65625 | 7.75 |
| 44486.666666666664 | 7.76 |
| 44486.677083333336 | 7.78 |
| 44486.6875 | 7.78 |
| 44486.697916666664 | 7.78 |
| 44486.708333333336 | 7.79 |
| 44486.71875 | 7.75 |
| 44486.729166666664 | 7.77 |
| 44486.739583333336 | 7.76 |
| 44486.75 | 7.78 |
| 44486.760416666664 | 7.77 |
| 44486.770833333336 | 7.77 |
| 44486.78125 | 7.77 |
| 44486.791666666664 | 7.77 |
| 44486.802083333336 | 7.78 |
| 44486.8125 | 7.8 |
| 44486.822916666664 | 7.82 |
| 44486.833333333336 | 7.83 |
| 44486.84375 | 7.85 |
| 44486.854166666664 | 7.86 |
| 44486.864583333336 | 7.87 |
| 44486.875 | 7.88 |
| 44486.885416666664 | 7.91 |
| 44486.895833333336 | 7.92 |
| 44486.90625 | 7.91 |
| 44486.916666666664 | 7.91 |
| 44486.927083333336 | 7.9 |
| 44486.9375 | 7.9 |
| 44486.947916666664 | 7.89 |
| 44486.958333333336 | 7.88 |
| 44486.96875 | 7.87 |
| 44486.979166666664 | 7.87 |
| 44486.989583333336 | 7.87 |
| 44487.0 | 7.87 |
| 44487.010416666664 | 7.87 |
| 44487.020833333336 | 7.87 |
| 44487.03125 | 7.87 |
| 44487.041666666664 | 7.87 |
| 44487.052083333336 | 7.87 |
| 44487.0625 | 7.85 |
| 44487.072916666664 | 7.85 |
| 44487.083333333336 | 7.84 |
| 44487.09375 | 7.82 |
| 44487.104166666664 | 7.81 |
| 44487.114583333336 | 7.78 |
| 44487.125 | 7.78 |
| 44487.135416666664 | 7.78 |
| 44487.145833333336 | 7.78 |
| 44487.15625 | 7.79 |
| 44487.166666666664 | 7.78 |
| 44487.177083333336 | 7.8 |
| 44487.1875 | 7.78 |
| 44487.197916666664 | 7.8 |
| 44487.208333333336 | 7.79 |
| 44487.21875 | 7.78 |
| 44487.229166666664 | 7.8 |
| 44487.239583333336 | 7.79 |
| 44487.25 | 7.8 |
| 44487.260416666664 | 7.79 |
| 44487.270833333336 | 7.77 |
| 44487.28125 | 7.79 |
| 44487.291666666664 | 7.79 |
| 44487.302083333336 | 7.79 |
| 44487.3125 | 7.8 |
| 44487.322916666664 | 7.8 |
| 44487.333333333336 | 7.8 |
| 44487.34375 | 7.8 |
| 44487.354166666664 | 7.8 |
| 44487.364583333336 | 7.81 |
| 44487.375 | 7.81 |
| 44487.385416666664 | 7.81 |
| 44487.395833333336 | 7.81 |
| 44487.40625 | 7.81 |
| 44487.416666666664 | 7.82 |
| 44487.427083333336 | 7.82 |
| 44487.4375 | 7.82 |
| 44487.447916666664 | 7.83 |
| 44487.458333333336 | 7.83 |
| 44487.46875 | 7.83 |
| 44487.479166666664 | 7.83 |
| 44487.489583333336 | 7.84 |
| 44487.5 | 7.84 |
| 44487.510416666664 | 7.84 |
| 44487.520833333336 | 7.84 |
| 44487.53125 | 7.84 |
| 44487.541666666664 | 7.83 |
| 44487.552083333336 | 7.83 |
| 44487.5625 | 7.83 |
| 44487.572916666664 | 7.81 |
| 44487.583333333336 | 7.81 |
| 44487.59375 | 7.81 |
| 44487.604166666664 | 7.81 |
| 44487.614583333336 | 7.79 |
| 44487.625 | 7.79 |
| 44487.635416666664 | 7.8 |
| 44487.645833333336 | 7.81 |
| 44487.65625 | 7.83 |
| 44487.666666666664 | 7.84 |
| 44487.677083333336 | 7.85 |
| 44487.6875 | 7.86 |
| 44487.697916666664 | 7.86 |
| 44487.708333333336 | 7.87 |
| 44487.71875 | 7.87 |
| 44487.729166666664 | 7.87 |
| 44487.739583333336 | 7.87 |
| 44487.75 | 7.86 |
| 44487.760416666664 | 7.86 |
| 44487.770833333336 | 7.85 |
| 44487.78125 | 7.86 |
| 44487.791666666664 | 7.86 |
| 44487.802083333336 | 7.86 |
| 44487.8125 | 7.86 |
| 44487.822916666664 | 7.86 |
| 44487.833333333336 | 7.86 |
| 44487.84375 | 7.88 |
| 44487.854166666664 | 7.91 |
| 44487.864583333336 | 7.93 |
| 44487.875 | 7.94 |
| 44487.885416666664 | 7.96 |
| 44487.895833333336 | 7.95 |
| 44487.90625 | 7.95 |
| 44487.916666666664 | 7.94 |
| 44487.927083333336 | 7.93 |
| 44487.9375 | 7.93 |
| 44487.947916666664 | 7.92 |
| 44487.958333333336 | 7.92 |
| 44487.96875 | 7.91 |
| 44487.979166666664 | 7.91 |
| 44487.989583333336 | 7.9 |
| 44488.0 | 7.9 |
| 44488.010416666664 | 7.9 |
| 44488.020833333336 | 7.89 |
| 44488.03125 | 7.9 |
| 44488.041666666664 | 7.9 |
| 44488.052083333336 | 7.89 |
| 44488.0625 | 7.89 |
| 44488.072916666664 | 7.89 |
| 44488.083333333336 | 7.88 |
| 44488.09375 | 7.88 |
| 44488.104166666664 | 7.88 |
| 44488.114583333336 | 7.87 |
| 44488.125 | 7.87 |
| 44488.135416666664 | 7.86 |
| 44488.145833333336 | 7.88 |
| 44488.15625 | 7.87 |
| 44488.166666666664 | 7.88 |
| 44488.177083333336 | 7.87 |
| 44488.1875 | 7.87 |
| 44488.197916666664 | 7.87 |
| 44488.208333333336 | 7.85 |
| 44488.21875 | 7.85 |
| 44488.229166666664 | 7.84 |
| 44488.239583333336 | 7.84 |
| 44488.25 | 7.84 |
| 44488.260416666664 | 7.84 |
| 44488.270833333336 | 7.85 |
| 44488.28125 | 7.84 |
| 44488.291666666664 | 7.83 |
| 44488.302083333336 | 7.84 |
| 44488.3125 | 7.85 |
| 44488.322916666664 | 7.85 |
| 44488.333333333336 | 7.85 |
| 44488.34375 | 7.85 |
| 44488.354166666664 | 7.85 |
| 44488.364583333336 | 7.86 |
| 44488.375 | 7.86 |
| 44488.385416666664 | 7.86 |
| 44488.395833333336 | 7.86 |
| 44488.40625 | 7.85 |
| 44488.416666666664 | 7.85 |
| 44488.427083333336 | 7.85 |
| 44488.4375 | 7.85 |
| 44488.447916666664 | 7.85 |
| 44488.458333333336 | 7.85 |
| 44488.46875 | 7.85 |
| 44488.479166666664 | 7.85 |
| 44488.489583333336 | 7.85 |
| 44488.5 | 7.85 |
| 44488.510416666664 | 7.85 |
| 44488.520833333336 | 7.85 |
| 44488.53125 | 7.85 |
| 44488.541666666664 | 7.85 |
| 44488.552083333336 | 7.85 |
| 44488.5625 | 7.85 |
| 44488.572916666664 | 7.85 |
| 44488.583333333336 | 7.85 |
| 44488.59375 | 7.84 |
| 44488.604166666664 | 7.84 |
| 44488.614583333336 | 7.84 |
| 44488.625 | 7.84 |
| 44488.635416666664 | 7.84 |
| 44488.645833333336 | 7.85 |
| 44488.65625 | 7.85 |
| 44488.666666666664 | 7.86 |
| 44488.677083333336 | 7.87 |
| 44488.6875 | 7.88 |
| 44488.697916666664 | 7.89 |
| 44488.708333333336 | 7.9 |
| 44488.71875 | 7.9 |
| 44488.729166666664 | 7.91 |
| 44488.739583333336 | 7.92 |
| 44488.75 | 7.92 |
| 44488.760416666664 | 7.91 |
| 44488.770833333336 | 7.92 |
| 44488.78125 | 7.92 |
| 44488.791666666664 | 7.9 |
| 44488.802083333336 | 7.9 |
| 44488.8125 | 7.91 |
| 44488.822916666664 | 7.9 |
| 44488.833333333336 | 7.9 |
| 44488.84375 | 7.91 |
| 44488.854166666664 | 7.91 |
| 44488.864583333336 | 7.92 |
| 44488.875 | 7.93 |
| 44488.885416666664 | 7.94 |
| 44488.895833333336 | 7.95 |
| 44488.90625 | 7.97 |
| 44488.916666666664 | 7.98 |
| 44488.927083333336 | 7.98 |
| 44488.9375 | 7.97 |
| 44488.947916666664 | 7.97 |
| 44488.958333333336 | 7.97 |
| 44488.96875 | 7.96 |
| 44488.979166666664 | 7.95 |
| 44488.989583333336 | 7.95 |
| 44489.0 | 7.94 |
| 44489.010416666664 | 7.94 |
| 44489.020833333336 | 7.93 |
| 44489.03125 | 7.93 |
| 44489.041666666664 | 7.93 |
| 44489.052083333336 | 7.93 |
| 44489.0625 | 7.93 |
| 44489.072916666664 | 7.93 |
| 44489.083333333336 | 7.93 |
| 44489.09375 | 7.92 |
| 44489.104166666664 | 7.92 |
| 44489.114583333336 | 7.91 |
| 44489.125 | 7.91 |
| 44489.135416666664 | 7.91 |
| 44489.145833333336 | 7.9 |
| 44489.15625 | 7.9 |
| 44489.166666666664 | 7.92 |
| 44489.177083333336 | 7.92 |
| 44489.1875 | 7.91 |
| 44489.197916666664 | 7.9 |
| 44489.208333333336 | 7.89 |
| 44489.21875 | 7.88 |
| 44489.229166666664 | 7.87 |
| 44489.239583333336 | 7.86 |
| 44489.25 | 7.86 |
| 44489.260416666664 | 7.86 |
| 44489.270833333336 | 7.85 |
| 44489.28125 | 7.85 |
| 44489.291666666664 | 7.85 |
| 44489.302083333336 | 7.84 |
| 44489.3125 | 7.85 |
| 44489.322916666664 | 7.85 |
| 44489.333333333336 | 7.85 |
| 44489.34375 | 7.85 |
| 44489.354166666664 | 7.86 |
| 44489.364583333336 | 7.86 |
| 44489.375 | 7.87 |
| 44489.385416666664 | 7.87 |
| 44489.395833333336 | 7.87 |
| 44489.40625 | 7.87 |
| 44489.416666666664 | 7.87 |
| 44489.427083333336 | 7.88 |
| 44489.4375 | 7.87 |
| 44489.447916666664 | 7.87 |
| 44489.458333333336 | 7.87 |
| 44489.46875 | 7.87 |
| 44489.479166666664 | 7.87 |
| 44489.489583333336 | 7.87 |
| 44489.5 | 7.87 |
| 44489.510416666664 | 7.87 |
| 44489.520833333336 | 7.87 |
| 44489.53125 | 7.87 |
| 44489.541666666664 | 7.87 |
| 44489.552083333336 | 7.87 |
| 44489.5625 | 7.87 |
| 44489.572916666664 | 7.87 |
| 44489.583333333336 | 7.87 |
| 44489.59375 | 7.87 |
| 44489.604166666664 | 7.87 |
| 44489.614583333336 | 7.87 |
| 44489.625 | 7.87 |
| 44489.635416666664 | 7.87 |
| 44489.645833333336 | 7.87 |
| 44489.65625 | 7.87 |
| 44489.666666666664 | 7.88 |
| 44489.677083333336 | 7.89 |
| 44489.6875 | 7.9 |
| 44489.697916666664 | 7.91 |
| 44489.708333333336 | 7.93 |
| 44489.71875 | 7.92 |
| 44489.729166666664 | 7.93 |
| 44489.739583333336 | 7.93 |
| 44489.75 | 7.93 |
| 44489.760416666664 | 7.93 |
| 44489.770833333336 | 7.92 |
| 44489.78125 | 7.93 |
| 44489.791666666664 | 7.92 |
| 44489.802083333336 | 7.93 |
| 44489.8125 | 7.92 |
| 44489.822916666664 | 7.92 |
| 44489.833333333336 | 7.92 |
| 44489.84375 | 7.92 |
| 44489.854166666664 | 7.91 |
| 44489.864583333336 | 7.91 |
| 44489.875 | 7.92 |
| 44489.885416666664 | 7.93 |
| 44489.895833333336 | 7.93 |
| 44489.90625 | 7.95 |
| 44489.916666666664 | 7.97 |
| 44489.927083333336 | 7.99 |
| 44489.9375 | 8 |
| 44489.947916666664 | 8.01 |
| 44489.958333333336 | 8.01 |
| 44489.96875 | 8.01 |
| 44489.979166666664 | 8 |
| 44489.989583333336 | 8 |
| 44490.0 | 7.99 |
| 44490.010416666664 | 7.98 |
| 44490.020833333336 | 7.98 |
| 44490.03125 | 7.97 |
| 44490.041666666664 | 7.96 |
| 44490.052083333336 | 7.96 |
| 44490.0625 | 7.96 |
| 44490.072916666664 | 7.95 |
| 44490.083333333336 | 7.95 |
| 44490.09375 | 7.95 |
| 44490.104166666664 | 7.95 |
| 44490.114583333336 | 7.95 |
| 44490.125 | 7.94 |
| 44490.135416666664 | 7.94 |
| 44490.145833333336 | 7.93 |
| 44490.15625 | 7.92 |
| 44490.166666666664 | 7.91 |
| 44490.177083333336 | 7.9 |
| 44490.1875 | 7.91 |
| 44490.197916666664 | 7.91 |
| 44490.208333333336 | 7.92 |
| 44490.21875 | 7.91 |
| 44490.229166666664 | 7.89 |
| 44490.239583333336 | 7.88 |
| 44490.25 | 7.88 |
| 44490.260416666664 | 7.87 |
| 44490.270833333336 | 7.87 |
| 44490.28125 | 7.86 |
| 44490.291666666664 | 7.86 |
| 44490.302083333336 | 7.86 |
| 44490.3125 | 7.87 |
| 44490.322916666664 | 7.86 |
| 44490.333333333336 | 7.86 |
| 44490.34375 | 7.86 |
| 44490.354166666664 | 7.86 |
| 44490.364583333336 | 7.87 |
| 44490.375 | 7.87 |
| 44490.385416666664 | 7.88 |
| 44490.395833333336 | 7.88 |
| 44490.40625 | 7.89 |
| 44490.416666666664 | 7.89 |
| 44490.427083333336 | 7.89 |
| 44490.4375 | 7.89 |
| 44490.447916666664 | 7.89 |
| 44490.458333333336 | 7.89 |
| 44490.46875 | 7.89 |
| 44490.479166666664 | 7.89 |
| 44490.489583333336 | 7.89 |
| 44490.5 | 7.89 |
| 44490.510416666664 | 7.88 |
| 44490.520833333336 | 7.88 |
| 44490.53125 | 7.88 |
| 44490.541666666664 | 7.88 |
| 44490.552083333336 | 7.88 |
| 44490.5625 | 7.89 |
| 44490.572916666664 | 7.89 |
| 44490.583333333336 | 7.89 |
| 44490.59375 | 7.89 |
| 44490.604166666664 | 7.89 |
| 44490.614583333336 | 7.89 |
| 44490.625 | 7.9 |
| 44490.635416666664 | 7.9 |
| 44490.645833333336 | 7.91 |
| 44490.65625 | 7.91 |
| 44490.666666666664 | 7.91 |
| 44490.677083333336 | 7.91 |
| 44490.6875 | 7.91 |
| 44490.697916666664 | 7.91 |
| 44490.708333333336 | 7.91 |
| 44490.71875 | 7.92 |
| 44490.729166666664 | 7.93 |
| 44490.739583333336 | 7.95 |
| 44490.75 | 7.95 |
| 44490.760416666664 | 7.96 |
| 44490.770833333336 | 7.97 |
| 44490.78125 | 7.97 |
| 44490.791666666664 | 7.98 |
| 44490.802083333336 | 7.98 |
| 44490.8125 | 7.98 |
| 44490.822916666664 | 7.97 |
| 44490.833333333336 | 7.98 |
| 44490.84375 | 7.97 |
| 44490.854166666664 | 7.96 |
| 44490.864583333336 | 7.95 |
| 44490.875 | 7.96 |
| 44490.885416666664 | 7.95 |
| 44490.895833333336 | 7.95 |
| 44490.90625 | 7.95 |
| 44490.916666666664 | 7.96 |
| 44490.927083333336 | 7.96 |
| 44490.9375 | 7.96 |
| 44490.947916666664 | 7.96 |
| 44490.958333333336 | 7.96 |
| 44490.96875 | 7.96 |
| 44490.979166666664 | 7.96 |
| 44490.989583333336 | 7.96 |
| 44491.0 | 7.97 |
| 44491.010416666664 | 7.97 |
| 44491.020833333336 | 7.97 |
| 44491.03125 | 7.97 |
| 44491.041666666664 | 7.97 |
| 44491.052083333336 | 7.97 |
| 44491.0625 | 7.97 |
| 44491.072916666664 | 7.97 |
| 44491.083333333336 | 7.97 |
| 44491.09375 | 7.97 |
| 44491.104166666664 | 7.94 |
| 44491.114583333336 | 7.95 |
| 44491.125 | 7.96 |
| 44491.135416666664 | 7.96 |
| 44491.145833333336 | 7.95 |
| 44491.15625 | 7.93 |
| 44491.166666666664 | 7.92 |
| 44491.177083333336 | 7.89 |
| 44491.1875 | 7.89 |
| 44491.197916666664 | 7.86 |
| 44491.208333333336 | 7.89 |
| 44491.21875 | 7.9 |
| 44491.229166666664 | 7.89 |
| 44491.239583333336 | 7.89 |
| 44491.25 | 7.89 |
| 44491.260416666664 | 7.88 |
| 44491.270833333336 | 7.88 |
| 44491.28125 | 7.87 |
| 44491.291666666664 | 7.87 |
| 44491.302083333336 | 7.86 |
| 44491.3125 | 7.86 |
| 44491.322916666664 | 7.85 |
| 44491.333333333336 | 7.85 |
| 44491.34375 | 7.85 |
| 44491.354166666664 | 7.85 |
| 44491.364583333336 | 7.85 |
| 44491.375 | 7.85 |
| 44491.385416666664 | 7.85 |
| 44491.395833333336 | 7.85 |
| 44491.40625 | 7.87 |
| 44491.416666666664 | 7.87 |
| 44491.427083333336 | 7.87 |
| 44491.4375 | 7.87 |
| 44491.447916666664 | 7.87 |
| 44491.458333333336 | 7.87 |
| 44491.46875 | 7.87 |
| 44491.479166666664 | 7.87 |
| 44491.489583333336 | 7.88 |
| 44491.5 | 7.88 |
| 44491.510416666664 | 7.89 |
| 44491.520833333336 | 7.9 |
| 44491.53125 | 7.9 |
| 44491.541666666664 | 7.9 |
| 44491.552083333336 | 7.9 |
| 44491.5625 | 7.91 |
| 44491.572916666664 | 7.91 |
| 44491.583333333336 | 7.91 |
| 44491.59375 | 7.91 |
| 44491.604166666664 | 7.91 |
| 44491.614583333336 | 7.91 |
| 44491.625 | 7.9 |
| 44491.635416666664 | 7.91 |
| 44491.645833333336 | 7.91 |
| 44491.65625 | 7.9 |
| 44491.666666666664 | 7.9 |
| 44491.677083333336 | 7.89 |
| 44491.6875 | 7.89 |
| 44491.697916666664 | 7.88 |
| 44491.708333333336 | 7.88 |
| 44491.71875 | 7.88 |
| 44491.729166666664 | 7.88 |
| 44491.739583333336 | 7.88 |
| 44491.75 | 7.88 |
| 44491.760416666664 | 7.89 |
| 44491.770833333336 | 7.9 |
| 44491.78125 | 7.9 |
| 44491.791666666664 | 7.91 |
| 44491.802083333336 | 7.91 |
| 44491.8125 | 7.91 |
| 44491.822916666664 | 7.91 |
| 44491.833333333336 | 7.9 |
| 44491.84375 | 7.89 |
| 44491.854166666664 | 7.88 |
| 44491.864583333336 | 7.88 |
| 44491.875 | 7.88 |
| 44491.885416666664 | 7.87 |
| 44491.895833333336 | 7.87 |
| 44491.90625 | 7.87 |
| 44491.916666666664 | 7.87 |
| 44491.927083333336 | 7.88 |
| 44491.9375 | 7.89 |
| 44491.947916666664 | 7.9 |
| 44491.958333333336 | 7.91 |
| 44491.96875 | 7.91 |
| 44491.979166666664 | 7.91 |
| 44491.989583333336 | 7.91 |
| 44492.0 | 7.92 |
| 44492.010416666664 | 7.92 |
| 44492.020833333336 | 7.92 |
| 44492.03125 | 7.93 |
| 44492.041666666664 | 7.93 |
| 44492.052083333336 | 7.93 |
| 44492.0625 | 7.94 |
| 44492.072916666664 | 7.94 |
| 44492.083333333336 | 7.94 |
| 44492.09375 | 7.94 |
| 44492.104166666664 | 7.94 |
| 44492.114583333336 | 7.94 |
| 44492.125 | 7.94 |
| 44492.135416666664 | 7.93 |
| 44492.145833333336 | 7.93 |
| 44492.15625 | 7.94 |
| 44492.166666666664 | 7.92 |
| 44492.177083333336 | 7.89 |
| 44492.1875 | 7.88 |
| 44492.197916666664 | 7.86 |
| 44492.208333333336 | 7.85 |
| 44492.21875 | 7.84 |
| 44492.229166666664 | 7.83 |
| 44492.239583333336 | 7.83 |
| 44492.25 | 7.83 |
| 44492.260416666664 | 7.86 |
| 44492.270833333336 | 7.82 |
| 44492.28125 | 7.83 |
| 44492.291666666664 | 7.82 |
| 44492.302083333336 | 7.82 |
| 44492.3125 | 7.82 |
| 44492.322916666664 | 7.81 |
| 44492.333333333336 | 7.81 |
| 44492.34375 | 7.81 |
| 44492.354166666664 | 7.81 |
| 44492.364583333336 | 7.81 |
| 44492.375 | 7.79 |
| 44492.385416666664 | 7.79 |
| 44492.395833333336 | 7.8 |
| 44492.40625 | 7.8 |
| 44492.416666666664 | 7.81 |
| 44492.427083333336 | 7.81 |
| 44492.4375 | 7.82 |
| 44492.447916666664 | 7.83 |
| 44492.458333333336 | 7.85 |
| 44492.46875 | 7.86 |
| 44492.479166666664 | 7.86 |
| 44492.489583333336 | 7.85 |
| 44492.5 | 7.86 |
| 44492.510416666664 | 7.86 |
| 44492.520833333336 | 7.86 |
| 44492.53125 | 7.86 |
| 44492.541666666664 | 7.87 |
| 44492.552083333336 | 7.87 |
| 44492.5625 | 7.87 |
| 44492.572916666664 | 7.87 |
| 44492.583333333336 | 7.87 |
| 44492.59375 | 7.88 |
| 44492.604166666664 | 7.88 |
| 44492.614583333336 | 7.88 |
| 44492.625 | 7.89 |
| 44492.635416666664 | 7.89 |
| 44492.645833333336 | 7.89 |
| 44492.65625 | 7.9 |
| 44492.666666666664 | 7.89 |
| 44492.677083333336 | 7.9 |
| 44492.6875 | 7.9 |
| 44492.697916666664 | 7.9 |
| 44492.708333333336 | 7.9 |
| 44492.71875 | 7.9 |
| 44492.729166666664 | 7.9 |
| 44492.739583333336 | 7.89 |
| 44492.75 | 7.9 |
| 44492.760416666664 | 7.91 |
| 44492.770833333336 | 7.91 |
| 44492.78125 | 7.91 |
| 44492.791666666664 | 7.92 |
| 44492.802083333336 | 7.93 |
| 44492.8125 | 7.93 |
| 44492.822916666664 | 7.94 |
| 44492.833333333336 | 7.94 |
| 44492.84375 | 7.93 |
| 44492.854166666664 | 7.93 |
| 44492.864583333336 | 7.92 |
| 44492.875 | 7.92 |
| 44492.885416666664 | 7.91 |
| 44492.895833333336 | 7.91 |
| 44492.90625 | 7.9 |
| 44492.916666666664 | 7.9 |
| 44492.927083333336 | 7.89 |
| 44492.9375 | 7.88 |
| 44492.947916666664 | 7.88 |
| 44492.958333333336 | 7.89 |
| 44492.96875 | 7.89 |
| 44492.979166666664 | 7.9 |
| 44492.989583333336 | 7.91 |
| 44493.0 | 7.91 |
| 44493.010416666664 | 7.91 |
| 44493.020833333336 | 7.91 |
| 44493.03125 | 7.91 |
| 44493.041666666664 | 7.91 |
| 44493.052083333336 | 7.91 |
| 44493.0625 | 7.91 |
| 44493.072916666664 | 7.9 |
| 44493.083333333336 | 7.9 |
| 44493.09375 | 7.9 |
| 44493.104166666664 | 7.9 |
| 44493.114583333336 | 7.9 |
| 44493.125 | 7.9 |
| 44493.135416666664 | 7.9 |
| 44493.145833333336 | 7.9 |
| 44493.15625 | 7.89 |
| 44493.166666666664 | 7.88 |
| 44493.177083333336 | 7.9 |
| 44493.1875 | 7.88 |
| 44493.197916666664 | 7.87 |
| 44493.208333333336 | 7.88 |
| 44493.21875 | 7.87 |
| 44493.229166666664 | 7.84 |
| 44493.239583333336 | 7.85 |
| 44493.25 | 7.84 |
| 44493.260416666664 | 7.84 |
| 44493.270833333336 | 7.86 |
| 44493.28125 | 7.85 |
| 44493.291666666664 | 7.84 |
| 44493.302083333336 | 7.84 |
| 44493.3125 | 7.83 |
| 44493.322916666664 | 7.82 |
| 44493.333333333336 | 7.82 |
| 44493.34375 | 7.81 |
| 44493.354166666664 | 7.81 |
| 44493.364583333336 | 7.8 |
| 44493.375 | 7.8 |
| 44493.385416666664 | 7.8 |
| 44493.395833333336 | 7.8 |
| 44493.40625 | 7.8 |
| 44493.416666666664 | 7.79 |
| 44493.427083333336 | 7.79 |
| 44493.4375 | 7.79 |
| 44493.447916666664 | 7.8 |
| 44493.458333333336 | 7.8 |
| 44493.46875 | 7.81 |
| 44493.479166666664 | 7.82 |
| 44493.489583333336 | 7.84 |
| 44493.5 | 7.84 |
| 44493.510416666664 | 7.84 |
| 44493.520833333336 | 7.84 |
| 44493.53125 | 7.84 |
| 44493.541666666664 | 7.84 |
| 44493.552083333336 | 7.84 |
| 44493.5625 | 7.84 |
| 44493.572916666664 | 7.85 |
| 44493.583333333336 | 7.85 |
| 44493.59375 | 7.86 |
| 44493.604166666664 | 7.87 |
| 44493.614583333336 | 7.88 |
| 44493.625 | 7.87 |
| 44493.635416666664 | 7.89 |
| 44493.645833333336 | 7.89 |
| 44493.65625 | 7.89 |
| 44493.666666666664 | 7.9 |
| 44493.677083333336 | 7.9 |
| 44493.6875 | 7.9 |
| 44493.697916666664 | 7.9 |
| 44493.708333333336 | 7.9 |
| 44493.71875 | 7.9 |
| 44493.729166666664 | 7.9 |
| 44493.739583333336 | 7.9 |
| 44493.75 | 7.9 |
| 44493.760416666664 | 7.9 |
| 44493.770833333336 | 7.9 |
| 44493.78125 | 7.9 |
| 44493.791666666664 | 7.91 |
| 44493.802083333336 | 7.92 |
| 44493.8125 | 7.93 |
| 44493.822916666664 | 7.93 |
| 44493.833333333336 | 7.95 |
| 44493.84375 | 7.95 |
| 44493.854166666664 | 7.95 |
| 44493.864583333336 | 7.95 |
| 44493.875 | 7.95 |
| 44493.885416666664 | 7.95 |
| 44493.895833333336 | 7.95 |
| 44493.90625 | 7.94 |
| 44493.916666666664 | 7.94 |
| 44493.927083333336 | 7.93 |
| 44493.9375 | 7.92 |
| 44493.947916666664 | 7.91 |
| 44493.958333333336 | 7.9 |
| 44493.96875 | 7.91 |
| 44493.979166666664 | 7.91 |
| 44493.989583333336 | 7.91 |
| 44494.0 | 7.91 |
| 44494.010416666664 | 7.91 |
| 44494.020833333336 | 7.91 |
| 44494.03125 | 7.91 |
| 44494.041666666664 | 7.9 |
| 44494.052083333336 | 7.9 |
| 44494.0625 | 7.89 |
| 44494.072916666664 | 7.89 |
| 44494.083333333336 | 7.88 |
| 44494.09375 | 7.88 |
| 44494.104166666664 | 7.88 |
| 44494.114583333336 | 7.88 |
| 44494.125 | 7.89 |
| 44494.135416666664 | 7.88 |
| 44494.145833333336 | 7.88 |
| 44494.15625 | 7.88 |
| 44494.166666666664 | 7.87 |
| 44494.177083333336 | 7.88 |
| 44494.1875 | 7.89 |
| 44494.197916666664 | 7.88 |
| 44494.208333333336 | 7.87 |
| 44494.21875 | 7.87 |
| 44494.229166666664 | 7.86 |
| 44494.239583333336 | 7.85 |
| 44494.25 | 7.83 |
| 44494.260416666664 | 7.82 |
| 44494.270833333336 | 7.81 |
| 44494.28125 | 7.83 |
| 44494.291666666664 | 7.85 |
| 44494.302083333336 | 7.84 |
| 44494.3125 | 7.83 |
| 44494.322916666664 | 7.85 |
| 44494.333333333336 | 7.84 |
| 44494.34375 | 7.83 |
| 44494.354166666664 | 7.83 |
| 44494.364583333336 | 7.82 |
| 44494.375 | 7.82 |
| 44494.385416666664 | 7.82 |
| 44494.395833333336 | 7.82 |
| 44494.40625 | 7.81 |
| 44494.416666666664 | 7.81 |
| 44494.427083333336 | 7.81 |
| 44494.4375 | 7.8 |
| 44494.447916666664 | 7.79 |
| 44494.458333333336 | 7.79 |
| 44494.46875 | 7.8 |
| 44494.479166666664 | 7.8 |
| 44494.489583333336 | 7.81 |
| 44494.5 | 7.81 |
| 44494.510416666664 | 7.82 |
| 44494.520833333336 | 7.82 |
| 44494.53125 | 7.83 |
| 44494.541666666664 | 7.83 |
| 44494.552083333336 | 7.83 |
| 44494.5625 | 7.83 |
| 44494.572916666664 | 7.82 |
| 44494.583333333336 | 7.82 |
| 44494.59375 | 7.82 |
| 44494.604166666664 | 7.83 |
| 44494.614583333336 | 7.83 |
| 44494.625 | 7.83 |
| 44494.635416666664 | 7.84 |
| 44494.645833333336 | 7.85 |
| 44494.65625 | 7.85 |
| 44494.666666666664 | 7.86 |
| 44494.677083333336 | 7.87 |
| 44494.6875 | 7.88 |
| 44494.697916666664 | 7.86 |
| 44494.708333333336 | 7.86 |
| 44494.71875 | 7.87 |
| 44494.729166666664 | 7.89 |
| 44494.739583333336 | 7.89 |
| 44494.75 | 7.89 |
| 44494.760416666664 | 7.89 |
| 44494.770833333336 | 7.89 |
| 44494.78125 | 7.89 |
| 44494.791666666664 | 7.89 |
| 44494.802083333336 | 7.9 |
| 44494.8125 | 7.9 |
| 44494.822916666664 | 7.9 |
| 44494.833333333336 | 7.91 |
| 44494.84375 | 7.9 |
| 44494.854166666664 | 7.91 |
| 44494.864583333336 | 7.92 |
| 44494.875 | 7.91 |
| 44494.885416666664 | 7.92 |
| 44494.895833333336 | 7.91 |
| 44494.90625 | 7.92 |
| 44494.916666666664 | 7.91 |
| 44494.927083333336 | 7.91 |
| 44494.9375 | 7.91 |
| 44494.947916666664 | 7.91 |
| 44494.958333333336 | 7.91 |
| 44494.96875 | 7.9 |
| 44494.979166666664 | 7.86 |
| 44494.989583333336 | 7.81 |
| 44495.0 | 7.85 |
| 44495.010416666664 | 7.85 |
| 44495.020833333336 | 7.86 |
| 44495.03125 | 7.85 |
| 44495.041666666664 | 7.85 |
| 44495.052083333336 | 7.84 |
| 44495.0625 | 7.84 |
| 44495.072916666664 | 7.85 |
| 44495.083333333336 | 7.84 |
| 44495.09375 | 7.84 |
| 44495.104166666664 | 7.83 |
| 44495.114583333336 | 7.83 |
| 44495.125 | 7.83 |
| 44495.135416666664 | 7.82 |
| 44495.145833333336 | 7.82 |
| 44495.15625 | 7.82 |
| 44495.166666666664 | 7.82 |
| 44495.177083333336 | 7.83 |
| 44495.1875 | 7.82 |
| 44495.197916666664 | 7.82 |
| 44495.208333333336 | 7.82 |
| 44495.21875 | 7.83 |
| 44495.229166666664 | 7.84 |
| 44495.239583333336 | 7.83 |
| 44495.25 | 7.81 |
| 44495.260416666664 | 7.82 |
| 44495.270833333336 | 7.8 |
| 44495.28125 | 7.78 |
| 44495.291666666664 | 7.78 |
| 44495.302083333336 | 7.76 |
| 44495.3125 | 7.78 |
| 44495.322916666664 | 7.78 |
| 44495.333333333336 | 7.79 |
| 44495.34375 | 7.81 |
| 44495.354166666664 | 7.79 |
| 44495.364583333336 | 7.78 |
| 44495.375 | 7.77 |
| 44495.385416666664 | 7.78 |
| 44495.395833333336 | 7.79 |
| 44495.40625 | 7.78 |
| 44495.416666666664 | 7.8 |
| 44495.427083333336 | 7.78 |
| 44495.4375 | 7.77 |
| 44495.447916666664 | 7.77 |
| 44495.458333333336 | 7.77 |
| 44495.46875 | 7.79 |
| 44495.479166666664 | 7.8 |
| 44495.489583333336 | 7.78 |
| 44495.5 | 7.76 |
| 44495.510416666664 | 7.76 |
| 44495.520833333336 | 7.76 |
| 44495.53125 | 7.78 |
| 44495.541666666664 | 7.78 |
| 44495.552083333336 | 7.78 |
| 44495.5625 | 7.8 |
| 44495.572916666664 | 7.8 |
| 44495.583333333336 | 7.81 |
| 44495.59375 | 7.81 |
| 44495.604166666664 | 7.81 |
| 44495.614583333336 | 7.81 |
| 44495.625 | 7.82 |
| 44495.635416666664 | 7.82 |
| 44495.645833333336 | 7.82 |
| 44495.65625 | 7.83 |
| 44495.666666666664 | 7.83 |
| 44495.677083333336 | 7.84 |
| 44495.6875 | 7.85 |
| 44495.697916666664 | 7.86 |
| 44495.708333333336 | 7.86 |
| 44495.71875 | 7.86 |
| 44495.729166666664 | 7.84 |
| 44495.739583333336 | 7.86 |
| 44495.75 | 7.88 |
| 44495.760416666664 | 7.88 |
| 44495.770833333336 | 7.89 |
| 44495.78125 | 7.89 |
| 44495.791666666664 | 7.89 |
| 44495.802083333336 | 7.89 |
| 44495.8125 | 7.89 |
| 44495.822916666664 | 7.89 |
| 44495.833333333336 | 7.89 |
| 44495.84375 | 7.9 |
| 44495.854166666664 | 7.89 |
| 44495.864583333336 | 7.89 |
| 44495.875 | 7.89 |
| 44495.885416666664 | 7.9 |
| 44495.895833333336 | 7.9 |
| 44495.90625 | 7.91 |
| 44495.916666666664 | 7.91 |
| 44495.927083333336 | 7.92 |
| 44495.9375 | 7.93 |
| 44495.947916666664 | 7.94 |
| 44495.958333333336 | 7.93 |
| 44495.96875 | 7.93 |
| 44495.979166666664 | 7.93 |
| 44495.989583333336 | 7.92 |
| 44496.0 | 7.89 |
| 44496.010416666664 | 7.86 |
| 44496.020833333336 | 7.89 |
| 44496.03125 | 7.87 |
| 44496.041666666664 | 7.84 |
| 44496.052083333336 | 7.83 |
| 44496.0625 | 7.84 |
| 44496.072916666664 | 7.86 |
| 44496.083333333336 | 7.85 |
| 44496.09375 | 7.86 |
| 44496.104166666664 | 7.87 |
| 44496.114583333336 | 7.87 |
| 44496.125 | 7.87 |
| 44496.135416666664 | 7.87 |
| 44496.145833333336 | 7.87 |
| 44496.15625 | 7.87 |
| 44496.166666666664 | 7.87 |
| 44496.177083333336 | 7.87 |
| 44496.1875 | 7.87 |
| 44496.197916666664 | 7.87 |
| 44496.208333333336 | 7.87 |
| 44496.21875 | 7.87 |
| 44496.229166666664 | 7.86 |
| 44496.239583333336 | 7.88 |
| 44496.25 | 7.9 |
| 44496.260416666664 | 7.9 |
| 44496.270833333336 | 7.89 |
| 44496.28125 | 7.89 |
| 44496.291666666664 | 7.89 |
| 44496.302083333336 | 7.87 |
| 44496.3125 | 7.88 |
| 44496.322916666664 | 7.87 |
| 44496.333333333336 | 7.87 |
| 44496.34375 | 7.86 |
| 44496.354166666664 | 7.85 |
| 44496.364583333336 | 7.85 |
| 44496.375 | 7.85 |
| 44496.385416666664 | 7.85 |
| 44496.395833333336 | 7.85 |
| 44496.40625 | 7.84 |
| 44496.416666666664 | 7.85 |
| 44496.427083333336 | 7.87 |
| 44496.4375 | 7.88 |
| 44496.447916666664 | 7.88 |
| 44496.458333333336 | 7.87 |
| 44496.46875 | 7.86 |
| 44496.479166666664 | 7.84 |
| 44496.489583333336 | 7.85 |
| 44496.5 | 7.86 |
| 44496.510416666664 | 7.86 |
| 44496.520833333336 | 7.86 |
| 44496.53125 | 7.87 |
| 44496.541666666664 | 7.87 |
| 44496.552083333336 | 7.88 |
| 44496.5625 | 7.88 |
| 44496.572916666664 | 7.88 |
| 44496.583333333336 | 7.89 |
| 44496.59375 | 7.89 |
| 44496.604166666664 | 7.9 |
| 44496.614583333336 | 7.9 |
| 44496.625 | 7.9 |
| 44496.635416666664 | 7.9 |
| 44496.645833333336 | 7.91 |
| 44496.65625 | 7.91 |
| 44496.666666666664 | 7.92 |
| 44496.677083333336 | 7.93 |
| 44496.6875 | 7.93 |
| 44496.697916666664 | 7.94 |
| 44496.708333333336 | 7.94 |
| 44496.71875 | 7.94 |
| 44496.729166666664 | 7.95 |
| 44496.739583333336 | 7.95 |
| 44496.75 | 7.95 |
| 44496.760416666664 | 7.95 |
| 44496.770833333336 | 7.95 |
| 44496.78125 | 7.94 |
| 44496.791666666664 | 7.95 |
| 44496.802083333336 | 7.94 |
| 44496.8125 | 7.94 |
| 44496.822916666664 | 7.95 |
| 44496.833333333336 | 7.95 |
| 44496.84375 | 7.94 |
| 44496.854166666664 | 7.95 |
| 44496.864583333336 | 7.94 |
| 44496.875 | 7.95 |
| 44496.885416666664 | 7.94 |
| 44496.895833333336 | 7.94 |
| 44496.90625 | 7.94 |
| 44496.916666666664 | 7.94 |
| 44496.927083333336 | 7.93 |
| 44496.9375 | 7.92 |
| 44496.947916666664 | 7.92 |
| 44496.958333333336 | 7.92 |
| 44496.96875 | 7.92 |
| 44496.979166666664 | 7.92 |
| 44496.989583333336 | 7.91 |
| 44497.0 | 7.91 |
| 44497.010416666664 | 7.91 |
| 44497.020833333336 | 7.92 |
| 44497.03125 | 7.92 |
| 44497.041666666664 | 7.92 |
| 44497.052083333336 | 7.92 |
| 44497.0625 | 7.9 |
| 44497.072916666664 | 7.88 |
| 44497.083333333336 | 7.9 |
| 44497.09375 | 7.9 |
| 44497.104166666664 | 7.9 |
| 44497.114583333336 | 7.9 |
| 44497.125 | 7.9 |
| 44497.135416666664 | 7.9 |
| 44497.145833333336 | 7.9 |
| 44497.15625 | 7.9 |
| 44497.166666666664 | 7.91 |
| 44497.177083333336 | 7.91 |
| 44497.1875 | 7.91 |
| 44497.197916666664 | 7.91 |
| 44497.208333333336 | 7.91 |
| 44497.21875 | 7.91 |
| 44497.229166666664 | 7.91 |
| 44497.239583333336 | 7.9 |
| 44497.25 | 7.88 |
| 44497.260416666664 | 7.89 |
| 44497.270833333336 | 7.88 |
| 44497.28125 | 7.88 |
| 44497.291666666664 | 7.87 |
| 44497.302083333336 | 7.86 |
| 44497.3125 | 7.85 |
| 44497.322916666664 | 7.84 |
| 44497.333333333336 | 7.83 |
| 44497.34375 | 7.85 |
| 44497.354166666664 | 7.82 |
| 44497.364583333336 | 7.82 |
| 44497.375 | 7.82 |
| 44497.385416666664 | 7.83 |
| 44497.395833333336 | 7.82 |
| 44497.40625 | 7.81 |
| 44497.416666666664 | 7.81 |
| 44497.427083333336 | 7.79 |
| 44497.4375 | 7.78 |
| 44497.447916666664 | 7.76 |
| 44497.458333333336 | 7.75 |
| 44497.46875 | 7.76 |
| 44497.479166666664 | 7.77 |
| 44497.489583333336 | 7.77 |
| 44497.5 | 7.76 |
| 44497.510416666664 | 7.76 |
| 44497.520833333336 | 7.82 |
| 44497.53125 | 7.78 |
| 44497.541666666664 | 7.77 |
| 44497.552083333336 | 7.78 |
| 44497.5625 | 7.78 |
| 44497.572916666664 | 7.79 |
| 44497.583333333336 | 7.8 |
| 44497.59375 | 7.81 |
| 44497.604166666664 | 7.81 |
| 44497.614583333336 | 7.81 |
| 44497.625 | 7.81 |
| 44497.635416666664 | 7.82 |
| 44497.645833333336 | 7.83 |
| 44497.65625 | 7.85 |
| 44497.666666666664 | 7.85 |
| 44497.677083333336 | 7.85 |
| 44497.6875 | 7.86 |
| 44497.697916666664 | 7.85 |
| 44497.708333333336 | 7.86 |
| 44497.71875 | 7.86 |
| 44497.729166666664 | 7.86 |
| 44497.739583333336 | 7.86 |
| 44497.75 | 7.87 |
| 44497.760416666664 | 7.87 |
| 44497.770833333336 | 7.87 |
| 44497.78125 | 7.88 |
| 44497.791666666664 | 7.84 |
| 44497.802083333336 | 7.88 |
| 44497.8125 | 7.87 |
| 44497.822916666664 | 7.89 |
| 44497.833333333336 | 7.89 |
| 44497.84375 | 7.89 |
| 44497.854166666664 | 7.89 |
| 44497.864583333336 | 7.89 |
| 44497.875 | 7.89 |
| 44497.885416666664 | 7.88 |
| 44497.895833333336 | 7.88 |
| 44497.90625 | 7.88 |
| 44497.916666666664 | 7.87 |
| 44497.927083333336 | 7.86 |
| 44497.9375 | 7.86 |
| 44497.947916666664 | 7.84 |
| 44497.958333333336 | 7.83 |
| 44497.96875 | 7.83 |
| 44497.979166666664 | 7.83 |
| 44497.989583333336 | 7.83 |
| 44498.0 | 7.83 |
| 44498.010416666664 | 7.82 |
| 44498.020833333336 | 7.82 |
| 44498.03125 | 7.85 |
| 44498.041666666664 | 7.82 |
| 44498.052083333336 | 7.86 |
| 44498.0625 | 7.87 |
| 44498.072916666664 | 7.85 |
| 44498.083333333336 | 7.86 |
| 44498.09375 | 7.87 |
| 44498.104166666664 | 7.87 |
| 44498.114583333336 | 7.87 |
| 44498.125 | 7.81 |
| 44498.135416666664 | 7.84 |
| 44498.145833333336 | 7.85 |
| 44498.15625 | 7.85 |
| 44498.166666666664 | 7.85 |
| 44498.177083333336 | 7.86 |
| 44498.1875 | 7.85 |
| 44498.197916666664 | 7.85 |
| 44498.208333333336 | 7.86 |
| 44498.21875 | 7.87 |
| 44498.229166666664 | 7.87 |
| 44498.239583333336 | 7.88 |
| 44498.25 | 7.88 |
| 44498.260416666664 | 7.88 |
| 44498.270833333336 | 7.88 |
| 44498.28125 | 7.82 |
| 44498.291666666664 | 7.73 |
| 44498.302083333336 | 7.79 |
| 44498.3125 | 7.77 |
| 44498.322916666664 | 7.76 |
| 44498.333333333336 | 7.8 |
| 44498.34375 | 7.78 |
| 44498.354166666664 | 7.79 |
| 44498.364583333336 | 7.78 |
| 44498.375 | 7.79 |
| 44498.385416666664 | 7.8 |
| 44498.395833333336 | 7.79 |
| 44498.40625 | 7.79 |
| 44498.416666666664 | 7.77 |
| 44498.427083333336 | 7.78 |
| 44498.4375 | 7.78 |
| 44498.447916666664 | 7.79 |
| 44498.458333333336 | 7.79 |
| 44498.46875 | 7.78 |
| 44498.479166666664 | 7.78 |
| 44498.489583333336 | 7.76 |
| 44498.5 | 7.77 |
| 44498.510416666664 | 7.79 |
| 44498.520833333336 | 7.77 |
| 44498.53125 | 7.8 |
| 44498.541666666664 | 7.82 |
| 44498.552083333336 | 7.83 |
| 44498.5625 | 7.83 |
| 44498.572916666664 | 7.83 |
| 44498.583333333336 | 7.84 |
| 44498.59375 | 7.84 |
| 44498.604166666664 | 7.83 |
| 44498.614583333336 | 7.83 |
| 44498.625 | 7.83 |
| 44498.635416666664 | 7.82 |
| 44498.645833333336 | 7.83 |
| 44498.65625 | 7.83 |
| 44498.666666666664 | 7.84 |
| 44498.677083333336 | 7.84 |
| 44498.6875 | 7.84 |
| 44498.697916666664 | 7.85 |
| 44498.708333333336 | 7.85 |
| 44498.71875 | 7.86 |
| 44498.729166666664 | 7.86 |
| 44498.739583333336 | 7.87 |
| 44498.75 | 7.87 |
| 44498.760416666664 | 7.87 |
| 44498.770833333336 | 7.87 |
| 44498.78125 | 7.87 |
| 44498.791666666664 | 7.87 |
| 44498.802083333336 | 7.87 |
| 44498.8125 | 7.86 |
| 44498.822916666664 | 7.85 |
| 44498.833333333336 | 7.84 |
| 44498.84375 | 7.85 |
| 44498.854166666664 | 7.84 |
| 44498.864583333336 | 7.83 |
| 44498.875 | 7.83 |
| 44498.885416666664 | 7.82 |
| 44498.895833333336 | 7.83 |
| 44498.90625 | 7.84 |
| 44498.916666666664 | 7.84 |
| 44498.927083333336 | 7.83 |
| 44498.9375 | 7.83 |
| 44498.947916666664 | 7.82 |
| 44498.958333333336 | 7.82 |
| 44498.96875 | 7.82 |
| 44498.979166666664 | 7.81 |
| 44498.989583333336 | 7.81 |
| 44499.0 | 7.82 |
| 44499.010416666664 | 7.81 |
| 44499.020833333336 | 7.8 |
| 44499.03125 | 7.78 |
| 44499.041666666664 | 7.76 |
| 44499.052083333336 | 7.77 |
| 44499.0625 | 7.78 |
| 44499.072916666664 | 7.76 |
| 44499.083333333336 | 7.76 |
| 44499.09375 | 7.76 |
| 44499.104166666664 | 7.77 |
| 44499.114583333336 | 7.78 |
| 44499.125 | 7.78 |
| 44499.135416666664 | 7.78 |
| 44499.145833333336 | 7.73 |
| 44499.15625 | 7.75 |
| 44499.166666666664 | 7.76 |
| 44499.177083333336 | 7.76 |
| 44499.1875 | 7.77 |
| 44499.197916666664 | 7.77 |
| 44499.208333333336 | 7.78 |
| 44499.21875 | 7.79 |
| 44499.229166666664 | 7.79 |
| 44499.239583333336 | 7.79 |
| 44499.25 | 7.79 |
| 44499.260416666664 | 7.78 |
| 44499.270833333336 | 7.78 |
| 44499.28125 | 7.79 |
| 44499.291666666664 | 7.79 |
| 44499.302083333336 | 7.78 |
| 44499.3125 | 7.77 |
| 44499.322916666664 | 7.79 |
| 44499.333333333336 | 7.78 |
| 44499.34375 | 7.79 |
| 44499.354166666664 | 7.79 |
| 44499.364583333336 | 7.79 |
| 44499.375 | 7.78 |
| 44499.385416666664 | 7.78 |
| 44499.395833333336 | 7.77 |
| 44499.40625 | 7.77 |
| 44499.416666666664 | 7.79 |
| 44499.427083333336 | 7.78 |
| 44499.4375 | 7.78 |
| 44499.447916666664 | 7.77 |
| 44499.458333333336 | 7.73 |
| 44499.46875 | 7.71 |
| 44499.479166666664 | 7.7 |
| 44499.489583333336 | 7.69 |
| 44499.5 | 7.66 |
| 44499.510416666664 | 7.65 |
| 44499.520833333336 | 7.64 |
| 44499.53125 | 7.63 |
| 44499.541666666664 | 7.64 |
| 44499.552083333336 | 7.68 |
| 44499.5625 | 7.7 |
| 44499.572916666664 | 7.7 |
| 44499.583333333336 | 7.69 |
| 44499.59375 | 7.69 |
| 44499.604166666664 | 7.69 |
| 44499.614583333336 | 7.68 |
| 44499.625 | 7.68 |
| 44499.635416666664 | 7.69 |
| 44499.645833333336 | 7.71 |
| 44499.65625 | 7.72 |
| 44499.666666666664 | 7.73 |
| 44499.677083333336 | 7.75 |
| 44499.6875 | 7.77 |
| 44499.697916666664 | 7.79 |
| 44499.708333333336 | 7.8 |
| 44499.71875 | 7.81 |
| 44499.729166666664 | 7.81 |
| 44499.739583333336 | 7.81 |
| 44499.75 | 7.81 |
| 44499.760416666664 | 7.81 |
| 44499.770833333336 | 7.82 |
| 44499.78125 | 7.83 |
| 44499.791666666664 | 7.84 |
| 44499.802083333336 | 7.85 |
| 44499.8125 | 7.86 |
| 44499.822916666664 | 7.86 |
| 44499.833333333336 | 7.86 |
| 44499.84375 | 7.87 |
| 44499.854166666664 | 7.86 |
| 44499.864583333336 | 7.84 |
| 44499.875 | 7.85 |
| 44499.885416666664 | 7.85 |
| 44499.895833333336 | 7.86 |
| 44499.90625 | 7.86 |
| 44499.916666666664 | 7.86 |
| 44499.927083333336 | 7.86 |
| 44499.9375 | 7.86 |
| 44499.947916666664 | 7.86 |
| 44499.958333333336 | 7.85 |
| 44499.96875 | 7.84 |
| 44499.979166666664 | 7.84 |
| 44499.989583333336 | 7.84 |
| 44500.0 | 7.83 |
| 44500.010416666664 | 7.83 |
| 44500.020833333336 | 7.81 |
| 44500.03125 | 7.81 |
| 44500.041666666664 | 7.79 |
| 44500.052083333336 | 7.79 |
| 44500.0625 | 7.76 |
| 44500.072916666664 | 7.75 |
| 44500.083333333336 | 7.75 |
| 44500.09375 | 7.76 |
| 44500.104166666664 | 7.75 |
| 44500.114583333336 | 7.76 |
| 44500.125 | 7.77 |
| 44500.135416666664 | 7.76 |
| 44500.145833333336 | 7.76 |
| 44500.15625 | 7.76 |
| 44500.166666666664 | 7.75 |
| 44500.177083333336 | 7.75 |
| 44500.1875 | 7.75 |
| 44500.197916666664 | 7.75 |
| 44500.208333333336 | 7.77 |
| 44500.21875 | 7.78 |
| 44500.229166666664 | 7.78 |
| 44500.239583333336 | 7.79 |
| 44500.25 | 7.8 |
| 44500.260416666664 | 7.8 |
| 44500.270833333336 | 7.81 |
| 44500.28125 | 7.81 |
| 44500.291666666664 | 7.81 |
| 44500.302083333336 | 7.81 |
| 44500.3125 | 7.81 |
| 44500.322916666664 | 7.81 |
| 44500.333333333336 | 7.81 |
| 44500.34375 | 7.81 |
| 44500.354166666664 | 7.81 |
| 44500.364583333336 | 7.81 |
| 44500.375 | 7.81 |
| 44500.385416666664 | 7.8 |
| 44500.395833333336 | 7.8 |
| 44500.40625 | 7.79 |
| 44500.416666666664 | 7.8 |
| 44500.427083333336 | 7.8 |
| 44500.4375 | 7.78 |
| 44500.447916666664 | 7.78 |
| 44500.458333333336 | 7.77 |
| 44500.46875 | 7.76 |
| 44500.479166666664 | 7.75 |
| 44500.489583333336 | 7.74 |
| 44500.5 | 7.71 |
| 44500.510416666664 | 7.68 |
| 44500.520833333336 | 7.69 |
| 44500.53125 | 7.65 |
| 44500.541666666664 | 7.65 |
| 44500.552083333336 | 7.63 |
| 44500.5625 | 7.63 |
| 44500.572916666664 | 7.63 |
| 44500.583333333336 | 7.65 |
| 44500.59375 | 7.65 |
| 44500.604166666664 | 7.66 |
| 44500.614583333336 | 7.68 |
| 44500.625 | 7.66 |
| 44500.635416666664 | 7.66 |
| 44500.645833333336 | 7.66 |
| 44500.65625 | 7.67 |
| 44500.666666666664 | 7.67 |
| 44500.677083333336 | 7.67 |
| 44500.6875 | 7.67 |
| 44500.697916666664 | 7.68 |
| 44500.708333333336 | 7.7 |
| 44500.71875 | 7.72 |
| 44500.729166666664 | 7.74 |
| 44500.739583333336 | 7.79 |
| 44500.75 | 7.83 |
| 44500.760416666664 | 7.84 |
| 44500.770833333336 | 7.85 |
| 44500.78125 | 7.85 |
| 44500.791666666664 | 7.86 |
| 44500.802083333336 | 7.86 |
| 44500.8125 | 7.86 |
| 44500.822916666664 | 7.86 |
| 44500.833333333336 | 7.86 |
| 44500.84375 | 7.87 |
| 44500.854166666664 | 7.87 |
| 44500.864583333336 | 7.88 |
| 44500.875 | 7.88 |
| 44500.885416666664 | 7.89 |
| 44500.895833333336 | 7.89 |
| 44500.90625 | 7.89 |
| 44500.916666666664 | 7.88 |
| 44500.927083333336 | 7.85 |
| 44500.9375 | 7.87 |
| 44500.947916666664 | 7.87 |
| 44500.958333333336 | 7.87 |
| 44500.96875 | 7.88 |
| 44500.979166666664 | 7.87 |
| 44500.989583333336 | 7.87 |
| 44501.0 | 7.88 |
| 44501.010416666664 | 7.85 |
| 44501.020833333336 | 7.84 |
| 44501.03125 | 7.83 |
| 44501.041666666664 | 7.81 |
| 44501.052083333336 | 7.78 |
| 44501.0625 | 7.77 |
| 44501.072916666664 | 7.76 |
| 44501.083333333336 | 7.75 |
| 44501.09375 | 7.75 |
| 44501.104166666664 | 7.76 |
| 44501.114583333336 | 7.76 |
| 44501.125 | 7.75 |
| 44501.135416666664 | 7.74 |
| 44501.145833333336 | 7.73 |
| 44501.15625 | 7.72 |